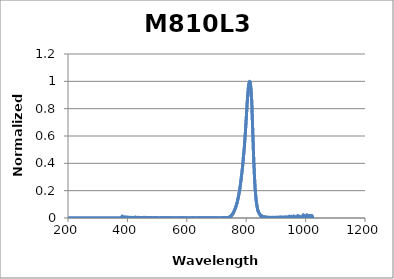
| Category | Normalized Intensity |
|---|---|
| 199.97546 | 0 |
| 200.17692 | 0 |
| 200.37839 | 0 |
| 200.57989 | 0 |
| 200.7814 | 0 |
| 200.98293 | 0 |
| 201.18448 | 0 |
| 201.38605 | 0 |
| 201.58764 | 0 |
| 201.78925 | 0 |
| 201.99087 | 0 |
| 202.19252 | 0 |
| 202.39418 | 0 |
| 202.59586 | 0 |
| 202.79756 | 0 |
| 202.99928 | 0 |
| 203.20102 | 0 |
| 203.40278 | 0 |
| 203.60455 | 0 |
| 203.80635 | 0 |
| 204.00816 | 0 |
| 204.20999 | 0 |
| 204.41184 | 0 |
| 204.61371 | 0 |
| 204.8156 | 0 |
| 205.0175 | 0 |
| 205.21943 | 0 |
| 205.42137 | 0 |
| 205.62334 | 0 |
| 205.82532 | 0 |
| 206.02732 | 0 |
| 206.22934 | 0 |
| 206.43137 | 0 |
| 206.63343 | 0 |
| 206.83551 | 0 |
| 207.0376 | 0 |
| 207.23971 | 0 |
| 207.44184 | 0 |
| 207.64399 | 0 |
| 207.84616 | 0 |
| 208.04835 | 0 |
| 208.25055 | 0 |
| 208.45278 | 0 |
| 208.65502 | 0 |
| 208.85728 | 0 |
| 209.05956 | 0 |
| 209.26186 | 0 |
| 209.46418 | 0 |
| 209.66651 | 0 |
| 209.86887 | 0 |
| 210.07124 | 0 |
| 210.27363 | 0 |
| 210.47604 | 0 |
| 210.67847 | 0 |
| 210.88092 | 0 |
| 211.08338 | 0 |
| 211.28587 | 0 |
| 211.48837 | 0 |
| 211.69089 | 0 |
| 211.89343 | 0 |
| 212.09599 | 0 |
| 212.29857 | 0 |
| 212.50117 | 0 |
| 212.70378 | 0 |
| 212.90641 | 0 |
| 213.10907 | 0 |
| 213.31174 | 0 |
| 213.51442 | 0 |
| 213.71713 | 0 |
| 213.91986 | 0 |
| 214.1226 | 0 |
| 214.32537 | 0 |
| 214.52815 | 0 |
| 214.73095 | 0 |
| 214.93376 | 0 |
| 215.1366 | 0 |
| 215.33946 | 0 |
| 215.54233 | 0 |
| 215.74522 | 0 |
| 215.94813 | 0 |
| 216.15106 | 0 |
| 216.35401 | 0 |
| 216.55698 | 0 |
| 216.75996 | 0 |
| 216.96297 | 0 |
| 217.16599 | 0 |
| 217.36903 | 0 |
| 217.57209 | 0 |
| 217.77517 | 0 |
| 217.97826 | 0 |
| 218.18138 | 0 |
| 218.38451 | 0 |
| 218.58766 | 0 |
| 218.79083 | 0 |
| 218.99402 | 0 |
| 219.19722 | 0 |
| 219.40045 | 0 |
| 219.60369 | 0 |
| 219.80695 | 0 |
| 220.01023 | 0 |
| 220.21353 | 0 |
| 220.41685 | 0 |
| 220.62018 | 0 |
| 220.82354 | 0 |
| 221.02691 | 0 |
| 221.2303 | 0 |
| 221.43371 | 0 |
| 221.63713 | 0 |
| 221.84058 | 0 |
| 222.04404 | 0 |
| 222.24753 | 0 |
| 222.45103 | 0 |
| 222.65455 | 0 |
| 222.85808 | 0 |
| 223.06164 | 0 |
| 223.26521 | 0 |
| 223.46881 | 0 |
| 223.67242 | 0 |
| 223.87605 | 0 |
| 224.07969 | 0 |
| 224.28336 | 0 |
| 224.48704 | 0 |
| 224.69075 | 0 |
| 224.89447 | 0 |
| 225.0982 | 0 |
| 225.30196 | 0 |
| 225.50574 | 0 |
| 225.70953 | 0 |
| 225.91334 | 0 |
| 226.11717 | 0 |
| 226.32102 | 0 |
| 226.52489 | 0 |
| 226.72878 | 0 |
| 226.93268 | 0 |
| 227.1366 | 0 |
| 227.34054 | 0 |
| 227.5445 | 0 |
| 227.74848 | 0 |
| 227.95247 | 0 |
| 228.15649 | 0 |
| 228.36052 | 0 |
| 228.56457 | 0 |
| 228.76863 | 0 |
| 228.97272 | 0 |
| 229.17683 | 0 |
| 229.38095 | 0 |
| 229.58509 | 0 |
| 229.78925 | 0 |
| 229.99343 | 0 |
| 230.19762 | 0 |
| 230.40183 | 0 |
| 230.60607 | 0 |
| 230.81032 | 0 |
| 231.01459 | 0 |
| 231.21887 | 0 |
| 231.42318 | 0 |
| 231.6275 | 0 |
| 231.83184 | 0 |
| 232.0362 | 0 |
| 232.24058 | 0 |
| 232.44497 | 0 |
| 232.64939 | 0 |
| 232.85382 | 0 |
| 233.05827 | 0 |
| 233.26274 | 0 |
| 233.46722 | 0 |
| 233.67173 | 0 |
| 233.87625 | 0 |
| 234.08079 | 0 |
| 234.28535 | 0 |
| 234.48993 | 0 |
| 234.69452 | 0 |
| 234.89914 | 0 |
| 235.10377 | 0 |
| 235.30842 | 0 |
| 235.51309 | 0 |
| 235.71777 | 0 |
| 235.92248 | 0 |
| 236.1272 | 0 |
| 236.33194 | 0 |
| 236.5367 | 0 |
| 236.74147 | 0 |
| 236.94627 | 0 |
| 237.15108 | 0 |
| 237.35591 | 0 |
| 237.56076 | 0 |
| 237.76563 | 0 |
| 237.97051 | 0 |
| 238.17541 | 0 |
| 238.38033 | 0 |
| 238.58527 | 0 |
| 238.79023 | 0 |
| 238.9952 | 0 |
| 239.2002 | 0 |
| 239.40521 | 0 |
| 239.61024 | 0 |
| 239.81529 | 0 |
| 240.02035 | 0 |
| 240.22543 | 0 |
| 240.43053 | 0 |
| 240.63565 | 0 |
| 240.84079 | 0 |
| 241.04595 | 0 |
| 241.25112 | 0 |
| 241.45631 | 0 |
| 241.66152 | 0 |
| 241.86675 | 0 |
| 242.07199 | 0 |
| 242.27726 | 0 |
| 242.48254 | 0 |
| 242.68784 | 0 |
| 242.89315 | 0 |
| 243.09849 | 0 |
| 243.30384 | 0 |
| 243.50921 | 0 |
| 243.7146 | 0 |
| 243.92001 | 0 |
| 244.12543 | 0 |
| 244.33087 | 0 |
| 244.53633 | 0 |
| 244.74181 | 0 |
| 244.94731 | 0 |
| 245.15282 | 0 |
| 245.35836 | 0 |
| 245.56391 | 0 |
| 245.76948 | 0 |
| 245.97506 | 0 |
| 246.18067 | 0 |
| 246.38629 | 0 |
| 246.59193 | 0 |
| 246.79758 | 0 |
| 247.00326 | 0 |
| 247.20895 | 0 |
| 247.41466 | 0 |
| 247.62039 | 0 |
| 247.82614 | 0 |
| 248.03191 | 0 |
| 248.23769 | 0 |
| 248.44349 | 0 |
| 248.64931 | 0 |
| 248.85514 | 0 |
| 249.061 | 0 |
| 249.26687 | 0 |
| 249.47276 | 0 |
| 249.67867 | 0 |
| 249.88459 | 0 |
| 250.09054 | 0 |
| 250.2965 | 0 |
| 250.50248 | 0 |
| 250.70847 | 0 |
| 250.91449 | 0 |
| 251.12052 | 0 |
| 251.32657 | 0 |
| 251.53264 | 0 |
| 251.73872 | 0 |
| 251.94483 | 0 |
| 252.15095 | 0 |
| 252.35709 | 0 |
| 252.56325 | 0 |
| 252.76942 | 0 |
| 252.97561 | 0 |
| 253.18182 | 0 |
| 253.38805 | 0 |
| 253.5943 | 0 |
| 253.80056 | 0 |
| 254.00684 | 0 |
| 254.21314 | 0 |
| 254.41946 | 0 |
| 254.62579 | 0 |
| 254.83214 | 0 |
| 255.03851 | 0 |
| 255.2449 | 0 |
| 255.45131 | 0 |
| 255.65773 | 0 |
| 255.86417 | 0 |
| 256.07063 | 0 |
| 256.27711 | 0 |
| 256.4836 | 0 |
| 256.69011 | 0 |
| 256.89664 | 0 |
| 257.10319 | 0 |
| 257.30975 | 0 |
| 257.51634 | 0 |
| 257.72294 | 0 |
| 257.92955 | 0 |
| 258.13619 | 0 |
| 258.34284 | 0 |
| 258.54951 | 0 |
| 258.7562 | 0 |
| 258.96291 | 0 |
| 259.16963 | 0 |
| 259.37637 | 0 |
| 259.58313 | 0 |
| 259.78991 | 0 |
| 259.9967 | 0 |
| 260.20351 | 0 |
| 260.41034 | 0 |
| 260.61719 | 0 |
| 260.82406 | 0 |
| 261.03094 | 0 |
| 261.23784 | 0 |
| 261.44476 | 0 |
| 261.65169 | 0 |
| 261.85864 | 0 |
| 262.06561 | 0 |
| 262.2726 | 0 |
| 262.47961 | 0 |
| 262.68663 | 0 |
| 262.89367 | 0 |
| 263.10073 | 0 |
| 263.30781 | 0 |
| 263.5149 | 0 |
| 263.72201 | 0 |
| 263.92914 | 0 |
| 264.13629 | 0 |
| 264.34345 | 0 |
| 264.55063 | 0 |
| 264.75783 | 0 |
| 264.96505 | 0 |
| 265.17228 | 0 |
| 265.37953 | 0 |
| 265.5868 | 0 |
| 265.79409 | 0 |
| 266.00139 | 0 |
| 266.20871 | 0 |
| 266.41605 | 0 |
| 266.62341 | 0 |
| 266.83078 | 0 |
| 267.03817 | 0 |
| 267.24558 | 0 |
| 267.45301 | 0 |
| 267.66045 | 0 |
| 267.86791 | 0 |
| 268.07539 | 0 |
| 268.28289 | 0 |
| 268.4904 | 0 |
| 268.69793 | 0 |
| 268.90548 | 0 |
| 269.11305 | 0 |
| 269.32063 | 0 |
| 269.52823 | 0 |
| 269.73585 | 0 |
| 269.94349 | 0 |
| 270.15114 | 0 |
| 270.35881 | 0 |
| 270.5665 | 0 |
| 270.77421 | 0 |
| 270.98193 | 0 |
| 271.18967 | 0 |
| 271.39743 | 0 |
| 271.60521 | 0 |
| 271.813 | 0 |
| 272.02081 | 0 |
| 272.22864 | 0 |
| 272.43648 | 0 |
| 272.64434 | 0 |
| 272.85222 | 0 |
| 273.06012 | 0 |
| 273.26804 | 0 |
| 273.47597 | 0 |
| 273.68392 | 0 |
| 273.89188 | 0 |
| 274.09987 | 0 |
| 274.30787 | 0 |
| 274.51589 | 0 |
| 274.72392 | 0 |
| 274.93198 | 0 |
| 275.14005 | 0 |
| 275.34814 | 0 |
| 275.55624 | 0 |
| 275.76437 | 0 |
| 275.97251 | 0 |
| 276.18066 | 0 |
| 276.38884 | 0 |
| 276.59703 | 0 |
| 276.80524 | 0 |
| 277.01347 | 0 |
| 277.22171 | 0 |
| 277.42997 | 0 |
| 277.63825 | 0 |
| 277.84655 | 0 |
| 278.05486 | 0 |
| 278.26319 | 0 |
| 278.47154 | 0 |
| 278.6799 | 0 |
| 278.88829 | 0 |
| 279.09669 | 0 |
| 279.3051 | 0 |
| 279.51354 | 0 |
| 279.72199 | 0 |
| 279.93046 | 0 |
| 280.13894 | 0 |
| 280.34745 | 0 |
| 280.55597 | 0 |
| 280.7645 | 0 |
| 280.97306 | 0 |
| 281.18163 | 0 |
| 281.39022 | 0 |
| 281.59883 | 0 |
| 281.80745 | 0 |
| 282.01609 | 0 |
| 282.22475 | 0 |
| 282.43342 | 0 |
| 282.64212 | 0 |
| 282.85083 | 0 |
| 283.05955 | 0 |
| 283.2683 | 0 |
| 283.47706 | 0 |
| 283.68584 | 0 |
| 283.89463 | 0 |
| 284.10345 | 0 |
| 284.31228 | 0 |
| 284.52112 | 0 |
| 284.72999 | 0 |
| 284.93887 | 0 |
| 285.14777 | 0 |
| 285.35668 | 0 |
| 285.56562 | 0 |
| 285.77457 | 0 |
| 285.98353 | 0 |
| 286.19252 | 0 |
| 286.40152 | 0 |
| 286.61054 | 0 |
| 286.81957 | 0 |
| 287.02863 | 0 |
| 287.2377 | 0 |
| 287.44678 | 0 |
| 287.65589 | 0 |
| 287.86501 | 0 |
| 288.07415 | 0 |
| 288.2833 | 0 |
| 288.49248 | 0 |
| 288.70167 | 0 |
| 288.91087 | 0 |
| 289.1201 | 0 |
| 289.32934 | 0 |
| 289.53859 | 0 |
| 289.74787 | 0 |
| 289.95716 | 0 |
| 290.16647 | 0 |
| 290.3758 | 0 |
| 290.58514 | 0 |
| 290.7945 | 0 |
| 291.00388 | 0 |
| 291.21327 | 0 |
| 291.42268 | 0 |
| 291.63211 | 0 |
| 291.84156 | 0 |
| 292.05102 | 0 |
| 292.2605 | 0 |
| 292.47 | 0 |
| 292.67951 | 0 |
| 292.88904 | 0 |
| 293.09859 | 0 |
| 293.30815 | 0 |
| 293.51773 | 0 |
| 293.72733 | 0 |
| 293.93695 | 0 |
| 294.14658 | 0 |
| 294.35623 | 0 |
| 294.56589 | 0 |
| 294.77558 | 0 |
| 294.98528 | 0 |
| 295.195 | 0 |
| 295.40473 | 0 |
| 295.61448 | 0 |
| 295.82425 | 0 |
| 296.03403 | 0 |
| 296.24384 | 0 |
| 296.45366 | 0 |
| 296.66349 | 0 |
| 296.87334 | 0 |
| 297.08321 | 0 |
| 297.2931 | 0 |
| 297.503 | 0 |
| 297.71292 | 0 |
| 297.92286 | 0 |
| 298.13282 | 0 |
| 298.34279 | 0 |
| 298.55277 | 0 |
| 298.76278 | 0 |
| 298.9728 | 0 |
| 299.18284 | 0 |
| 299.3929 | 0 |
| 299.60297 | 0 |
| 299.81306 | 0 |
| 300.02316 | 0 |
| 300.23329 | 0 |
| 300.44343 | 0 |
| 300.65358 | 0 |
| 300.86376 | 0 |
| 301.07395 | 0 |
| 301.28416 | 0 |
| 301.49438 | 0 |
| 301.70462 | 0 |
| 301.91488 | 0 |
| 302.12515 | 0 |
| 302.33544 | 0 |
| 302.54575 | 0 |
| 302.75608 | 0 |
| 302.96642 | 0 |
| 303.17678 | 0 |
| 303.38715 | 0 |
| 303.59755 | 0 |
| 303.80796 | 0 |
| 304.01838 | 0 |
| 304.22882 | 0 |
| 304.43928 | 0 |
| 304.64976 | 0 |
| 304.86025 | 0 |
| 305.07076 | 0 |
| 305.28129 | 0 |
| 305.49183 | 0 |
| 305.70239 | 0 |
| 305.91297 | 0 |
| 306.12356 | 0 |
| 306.33417 | 0 |
| 306.5448 | 0 |
| 306.75545 | 0 |
| 306.96611 | 0 |
| 307.17678 | 0 |
| 307.38748 | 0 |
| 307.59819 | 0 |
| 307.80892 | 0 |
| 308.01966 | 0 |
| 308.23042 | 0 |
| 308.4412 | 0 |
| 308.65199 | 0 |
| 308.8628 | 0 |
| 309.07363 | 0 |
| 309.28448 | 0 |
| 309.49534 | 0 |
| 309.70622 | 0 |
| 309.91711 | 0 |
| 310.12802 | 0 |
| 310.33895 | 0 |
| 310.54989 | 0 |
| 310.76085 | 0 |
| 310.97183 | 0 |
| 311.18283 | 0 |
| 311.39384 | 0 |
| 311.60487 | 0 |
| 311.81591 | 0 |
| 312.02697 | 0 |
| 312.23805 | 0 |
| 312.44914 | 0 |
| 312.66025 | 0 |
| 312.87138 | 0 |
| 313.08253 | 0 |
| 313.29369 | 0 |
| 313.50486 | 0 |
| 313.71606 | 0 |
| 313.92727 | 0 |
| 314.1385 | 0 |
| 314.34974 | 0 |
| 314.561 | 0 |
| 314.77228 | 0 |
| 314.98357 | 0 |
| 315.19488 | 0 |
| 315.40621 | 0 |
| 315.61755 | 0 |
| 315.82891 | 0 |
| 316.04029 | 0 |
| 316.25168 | 0 |
| 316.46309 | 0 |
| 316.67452 | 0 |
| 316.88596 | 0 |
| 317.09742 | 0 |
| 317.3089 | 0 |
| 317.52039 | 0 |
| 317.7319 | 0 |
| 317.94342 | 0 |
| 318.15496 | 0 |
| 318.36652 | 0 |
| 318.5781 | 0 |
| 318.78969 | 0 |
| 319.0013 | 0 |
| 319.21292 | 0 |
| 319.42456 | 0 |
| 319.63622 | 0 |
| 319.84789 | 0 |
| 320.05958 | 0 |
| 320.27129 | 0 |
| 320.48302 | 0 |
| 320.69476 | 0 |
| 320.90651 | 0 |
| 321.11828 | 0 |
| 321.33007 | 0 |
| 321.54188 | 0 |
| 321.7537 | 0 |
| 321.96554 | 0 |
| 322.1774 | 0 |
| 322.38927 | 0 |
| 322.60116 | 0 |
| 322.81306 | 0 |
| 323.02498 | 0 |
| 323.23692 | 0 |
| 323.44887 | 0 |
| 323.66084 | 0 |
| 323.87283 | 0 |
| 324.08483 | 0 |
| 324.29685 | 0 |
| 324.50889 | 0 |
| 324.72094 | 0 |
| 324.93301 | 0 |
| 325.14509 | 0 |
| 325.35719 | 0 |
| 325.56931 | 0 |
| 325.78145 | 0 |
| 325.9936 | 0 |
| 326.20576 | 0 |
| 326.41795 | 0 |
| 326.63015 | 0 |
| 326.84236 | 0 |
| 327.0546 | 0 |
| 327.26684 | 0 |
| 327.47911 | 0 |
| 327.69139 | 0 |
| 327.90369 | 0 |
| 328.116 | 0 |
| 328.32833 | 0 |
| 328.54068 | 0 |
| 328.75304 | 0 |
| 328.96542 | 0 |
| 329.17782 | 0 |
| 329.39023 | 0 |
| 329.60266 | 0 |
| 329.8151 | 0 |
| 330.02756 | 0 |
| 330.24004 | 0 |
| 330.45253 | 0 |
| 330.66504 | 0 |
| 330.87757 | 0 |
| 331.09011 | 0 |
| 331.30267 | 0 |
| 331.51525 | 0 |
| 331.72784 | 0 |
| 331.94045 | 0 |
| 332.15307 | 0 |
| 332.36571 | 0 |
| 332.57837 | 0 |
| 332.79104 | 0 |
| 333.00373 | 0 |
| 333.21643 | 0 |
| 333.42915 | 0 |
| 333.64189 | 0 |
| 333.85464 | 0 |
| 334.06741 | 0 |
| 334.2802 | 0 |
| 334.493 | 0 |
| 334.70582 | 0 |
| 334.91866 | 0 |
| 335.13151 | 0 |
| 335.34437 | 0 |
| 335.55726 | 0 |
| 335.77016 | 0 |
| 335.98307 | 0 |
| 336.196 | 0 |
| 336.40895 | 0 |
| 336.62192 | 0 |
| 336.8349 | 0 |
| 337.04789 | 0 |
| 337.26091 | 0 |
| 337.47394 | 0 |
| 337.68698 | 0 |
| 337.90004 | 0 |
| 338.11312 | 0 |
| 338.32621 | 0 |
| 338.53932 | 0 |
| 338.75245 | 0 |
| 338.96559 | 0 |
| 339.17875 | 0 |
| 339.39192 | 0 |
| 339.60511 | 0 |
| 339.81832 | 0 |
| 340.03154 | 0 |
| 340.24478 | 0 |
| 340.45804 | 0 |
| 340.67131 | 0 |
| 340.88459 | 0 |
| 341.0979 | 0 |
| 341.31122 | 0 |
| 341.52455 | 0 |
| 341.7379 | 0 |
| 341.95127 | 0 |
| 342.16465 | 0 |
| 342.37805 | 0 |
| 342.59147 | 0 |
| 342.8049 | 0 |
| 343.01835 | 0 |
| 343.23181 | 0 |
| 343.44529 | 0 |
| 343.65879 | 0 |
| 343.8723 | 0 |
| 344.08583 | 0 |
| 344.29937 | 0 |
| 344.51293 | 0 |
| 344.72651 | 0 |
| 344.9401 | 0 |
| 345.15371 | 0 |
| 345.36733 | 0 |
| 345.58097 | 0 |
| 345.79463 | 0 |
| 346.0083 | 0 |
| 346.22199 | 0 |
| 346.43569 | 0 |
| 346.64941 | 0 |
| 346.86315 | 0 |
| 347.0769 | 0 |
| 347.29067 | 0 |
| 347.50446 | 0 |
| 347.71826 | 0 |
| 347.93207 | 0 |
| 348.1459 | 0 |
| 348.35975 | 0 |
| 348.57362 | 0 |
| 348.78749 | 0 |
| 349.00139 | 0 |
| 349.2153 | 0 |
| 349.42923 | 0 |
| 349.64317 | 0 |
| 349.85713 | 0 |
| 350.07111 | 0 |
| 350.2851 | 0 |
| 350.49911 | 0 |
| 350.71313 | 0 |
| 350.92717 | 0 |
| 351.14122 | 0 |
| 351.3553 | 0 |
| 351.56938 | 0 |
| 351.78349 | 0 |
| 351.9976 | 0 |
| 352.21174 | 0 |
| 352.42589 | 0 |
| 352.64005 | 0 |
| 352.85424 | 0 |
| 353.06844 | 0 |
| 353.28265 | 0 |
| 353.49688 | 0 |
| 353.71112 | 0 |
| 353.92539 | 0 |
| 354.13966 | 0 |
| 354.35396 | 0 |
| 354.56827 | 0 |
| 354.78259 | 0 |
| 354.99693 | 0 |
| 355.21129 | 0 |
| 355.42566 | 0 |
| 355.64005 | 0 |
| 355.85445 | 0 |
| 356.06887 | 0 |
| 356.28331 | 0 |
| 356.49776 | 0 |
| 356.71223 | 0 |
| 356.92671 | 0 |
| 357.14121 | 0 |
| 357.35572 | 0 |
| 357.57025 | 0 |
| 357.7848 | 0 |
| 357.99936 | 0 |
| 358.21394 | 0 |
| 358.42853 | 0 |
| 358.64314 | 0 |
| 358.85777 | 0 |
| 359.07241 | 0 |
| 359.28706 | 0 |
| 359.50173 | 0 |
| 359.71642 | 0 |
| 359.93113 | 0 |
| 360.14585 | 0 |
| 360.36058 | 0 |
| 360.57533 | 0 |
| 360.7901 | 0 |
| 361.00488 | 0 |
| 361.21968 | 0 |
| 361.43449 | 0 |
| 361.64932 | 0 |
| 361.86417 | 0 |
| 362.07903 | 0 |
| 362.29391 | 0 |
| 362.5088 | 0 |
| 362.72371 | 0 |
| 362.93863 | 0 |
| 363.15357 | 0 |
| 363.36852 | 0 |
| 363.58349 | 0 |
| 363.79848 | 0 |
| 364.01348 | 0 |
| 364.2285 | 0 |
| 364.44353 | 0 |
| 364.65858 | 0 |
| 364.87365 | 0 |
| 365.08873 | 0 |
| 365.30382 | 0 |
| 365.51894 | 0 |
| 365.73406 | 0 |
| 365.94921 | 0 |
| 366.16436 | 0 |
| 366.37954 | 0 |
| 366.59473 | 0 |
| 366.80993 | 0 |
| 367.02515 | 0 |
| 367.24039 | 0 |
| 367.45564 | 0 |
| 367.67091 | 0 |
| 367.88619 | 0 |
| 368.10149 | 0 |
| 368.31681 | 0 |
| 368.53214 | 0 |
| 368.74748 | 0 |
| 368.96285 | 0 |
| 369.17822 | 0 |
| 369.39361 | 0 |
| 369.60902 | 0 |
| 369.82445 | 0 |
| 370.03989 | 0 |
| 370.25534 | 0 |
| 370.47081 | 0 |
| 370.6863 | 0 |
| 370.9018 | 0 |
| 371.11731 | 0 |
| 371.33285 | 0 |
| 371.54839 | 0 |
| 371.76396 | 0 |
| 371.97954 | 0 |
| 372.19513 | 0 |
| 372.41074 | 0 |
| 372.62637 | 0 |
| 372.84201 | 0 |
| 373.05766 | 0 |
| 373.27334 | 0 |
| 373.48902 | 0 |
| 373.70473 | 0 |
| 373.92044 | 0 |
| 374.13618 | 0 |
| 374.35193 | 0 |
| 374.56769 | 0 |
| 374.78347 | 0 |
| 374.99927 | 0 |
| 375.21508 | 0 |
| 375.43091 | 0 |
| 375.64675 | 0 |
| 375.86261 | 0 |
| 376.07848 | 0 |
| 376.29437 | 0 |
| 376.51027 | 0 |
| 376.72619 | 0 |
| 376.94213 | 0 |
| 377.15808 | 0 |
| 377.37404 | 0 |
| 377.59002 | 0 |
| 377.80602 | 0 |
| 378.02203 | 0 |
| 378.23806 | 0 |
| 378.4541 | 0 |
| 378.67016 | 0 |
| 378.88623 | 0 |
| 379.10232 | 0 |
| 379.31842 | 0 |
| 379.53454 | 0 |
| 379.75068 | 0 |
| 379.96683 | 0 |
| 380.183 | 0 |
| 380.39918 | 0 |
| 380.61537 | 0 |
| 380.83158 | 0 |
| 381.04781 | -0.001 |
| 381.26405 | 0 |
| 381.48031 | 0.009 |
| 381.69659 | -0.006 |
| 381.91287 | 0.003 |
| 382.12918 | -0.023 |
| 382.3455 | 0.014 |
| 382.56183 | -0.001 |
| 382.77818 | -0.005 |
| 382.99455 | -0.003 |
| 383.21093 | 0.003 |
| 383.42732 | -0.001 |
| 383.64373 | 0.008 |
| 383.86016 | -0.002 |
| 384.0766 | 0.002 |
| 384.29306 | 0 |
| 384.50953 | -0.001 |
| 384.72602 | -0.014 |
| 384.94252 | 0.012 |
| 385.15904 | -0.007 |
| 385.37557 | -0.004 |
| 385.59212 | -0.005 |
| 385.80868 | 0.002 |
| 386.02526 | -0.006 |
| 386.24186 | 0.002 |
| 386.45847 | -0.003 |
| 386.67509 | -0.001 |
| 386.89173 | -0.005 |
| 387.10839 | 0.004 |
| 387.32506 | -0.008 |
| 387.54174 | -0.001 |
| 387.75844 | 0.002 |
| 387.97516 | 0.008 |
| 388.19189 | 0 |
| 388.40864 | 0.003 |
| 388.6254 | -0.003 |
| 388.84218 | -0.002 |
| 389.05897 | -0.002 |
| 389.27578 | 0 |
| 389.4926 | 0 |
| 389.70944 | -0.004 |
| 389.92629 | 0.001 |
| 390.14316 | 0.001 |
| 390.36004 | -0.005 |
| 390.57694 | 0.003 |
| 390.79385 | -0.007 |
| 391.01078 | 0.009 |
| 391.22773 | -0.004 |
| 391.44469 | 0 |
| 391.66166 | 0 |
| 391.87865 | 0 |
| 392.09566 | -0.004 |
| 392.31268 | 0.003 |
| 392.52971 | -0.006 |
| 392.74676 | 0.002 |
| 392.96383 | -0.004 |
| 393.18091 | 0.004 |
| 393.398 | -0.005 |
| 393.61511 | 0.002 |
| 393.83224 | 0.003 |
| 394.04938 | 0.006 |
| 394.26653 | 0.003 |
| 394.48371 | 0.001 |
| 394.70089 | -0.005 |
| 394.91809 | 0.001 |
| 395.13531 | -0.008 |
| 395.35254 | 0.001 |
| 395.56979 | -0.002 |
| 395.78705 | 0.006 |
| 396.00433 | -0.003 |
| 396.22162 | 0.001 |
| 396.43892 | -0.002 |
| 396.65625 | 0.006 |
| 396.87358 | -0.004 |
| 397.09094 | 0.002 |
| 397.3083 | -0.003 |
| 397.52568 | 0.008 |
| 397.74308 | 0 |
| 397.96049 | 0.004 |
| 398.17792 | 0.001 |
| 398.39536 | -0.003 |
| 398.61282 | -0.007 |
| 398.83029 | -0.002 |
| 399.04778 | -0.002 |
| 399.26528 | 0.001 |
| 399.4828 | -0.004 |
| 399.70033 | 0.004 |
| 399.91788 | 0.002 |
| 400.13544 | 0.002 |
| 400.35302 | 0.002 |
| 400.57061 | 0 |
| 400.78822 | -0.004 |
| 401.00584 | 0.003 |
| 401.22348 | 0.005 |
| 401.44113 | 0.006 |
| 401.6588 | -0.003 |
| 401.87648 | 0.003 |
| 402.09418 | -0.004 |
| 402.31189 | 0.004 |
| 402.52962 | -0.003 |
| 402.74736 | 0.002 |
| 402.96512 | 0.003 |
| 403.18289 | -0.002 |
| 403.40067 | -0.003 |
| 403.61848 | 0.005 |
| 403.83629 | -0.003 |
| 404.05412 | 0.001 |
| 404.27197 | 0.003 |
| 404.48983 | 0 |
| 404.70771 | -0.003 |
| 404.9256 | 0.005 |
| 405.14351 | 0 |
| 405.36143 | 0.003 |
| 405.57936 | -0.003 |
| 405.79731 | -0.001 |
| 406.01528 | -0.006 |
| 406.23326 | 0.004 |
| 406.45126 | 0 |
| 406.66927 | 0.003 |
| 406.88729 | -0.003 |
| 407.10533 | 0.001 |
| 407.32339 | 0 |
| 407.54146 | 0.002 |
| 407.75954 | 0.003 |
| 407.97764 | 0 |
| 408.19576 | -0.002 |
| 408.41389 | -0.003 |
| 408.63203 | -0.001 |
| 408.85019 | -0.002 |
| 409.06836 | 0.004 |
| 409.28655 | -0.003 |
| 409.50476 | 0.003 |
| 409.72297 | 0.002 |
| 409.94121 | 0.003 |
| 410.15946 | -0.005 |
| 410.37772 | 0.002 |
| 410.596 | 0.001 |
| 410.81429 | 0.003 |
| 411.0326 | -0.005 |
| 411.25092 | 0.003 |
| 411.46925 | -0.001 |
| 411.68761 | 0.006 |
| 411.90597 | -0.002 |
| 412.12435 | 0.002 |
| 412.34275 | 0 |
| 412.56116 | -0.008 |
| 412.77959 | -0.002 |
| 412.99803 | 0 |
| 413.21648 | -0.004 |
| 413.43495 | 0.003 |
| 413.65344 | -0.001 |
| 413.87193 | 0 |
| 414.09045 | -0.001 |
| 414.30898 | 0.004 |
| 414.52752 | -0.002 |
| 414.74608 | 0.002 |
| 414.96465 | -0.003 |
| 415.18324 | 0.002 |
| 415.40184 | -0.003 |
| 415.62046 | 0 |
| 415.83909 | -0.001 |
| 416.05774 | 0.001 |
| 416.2764 | -0.001 |
| 416.49508 | -0.002 |
| 416.71377 | -0.004 |
| 416.93247 | 0.004 |
| 417.15119 | 0 |
| 417.36993 | 0.002 |
| 417.58868 | 0 |
| 417.80744 | 0.002 |
| 418.02622 | 0.001 |
| 418.24501 | 0 |
| 418.46382 | -0.007 |
| 418.68264 | 0.003 |
| 418.90148 | -0.003 |
| 419.12033 | 0.001 |
| 419.3392 | -0.002 |
| 419.55808 | 0.001 |
| 419.77698 | -0.004 |
| 419.99589 | 0.003 |
| 420.21481 | -0.002 |
| 420.43375 | 0 |
| 420.65271 | -0.001 |
| 420.87167 | -0.001 |
| 421.09066 | -0.002 |
| 421.30966 | -0.002 |
| 421.52867 | -0.003 |
| 421.7477 | 0.003 |
| 421.96674 | -0.002 |
| 422.1858 | 0.005 |
| 422.40487 | -0.003 |
| 422.62395 | 0 |
| 422.84305 | 0 |
| 423.06217 | 0 |
| 423.2813 | -0.004 |
| 423.50044 | 0.006 |
| 423.7196 | -0.001 |
| 423.93878 | 0.006 |
| 424.15796 | -0.002 |
| 424.37717 | 0.001 |
| 424.59638 | -0.002 |
| 424.81561 | 0.004 |
| 425.03486 | -0.003 |
| 425.25412 | 0.002 |
| 425.4734 | -0.002 |
| 425.69269 | 0.001 |
| 425.91199 | -0.002 |
| 426.13131 | 0.002 |
| 426.35064 | -0.001 |
| 426.56999 | -0.001 |
| 426.78935 | -0.001 |
| 427.00873 | -0.003 |
| 427.22812 | 0.002 |
| 427.44753 | 0.007 |
| 427.66695 | 0.001 |
| 427.88638 | 0.002 |
| 428.10583 | -0.004 |
| 428.3253 | 0.002 |
| 428.54477 | 0 |
| 428.76427 | 0.003 |
| 428.98377 | 0.002 |
| 429.2033 | 0.001 |
| 429.42283 | -0.002 |
| 429.64238 | 0 |
| 429.86195 | -0.005 |
| 430.08153 | 0 |
| 430.30112 | -0.004 |
| 430.52073 | 0 |
| 430.74035 | 0 |
| 430.95999 | 0.001 |
| 431.17964 | 0 |
| 431.39931 | 0.002 |
| 431.61899 | 0 |
| 431.83868 | 0.003 |
| 432.05839 | 0.001 |
| 432.27812 | -0.002 |
| 432.49785 | -0.004 |
| 432.71761 | 0 |
| 432.93737 | -0.001 |
| 433.15716 | 0.001 |
| 433.37695 | 0.002 |
| 433.59676 | 0.004 |
| 433.81659 | -0.003 |
| 434.03643 | 0 |
| 434.25628 | -0.004 |
| 434.47615 | 0.001 |
| 434.69603 | -0.001 |
| 434.91593 | 0.002 |
| 435.13584 | -0.003 |
| 435.35576 | 0.002 |
| 435.5757 | -0.001 |
| 435.79565 | 0.005 |
| 436.01562 | 0 |
| 436.23561 | 0.001 |
| 436.4556 | -0.004 |
| 436.67561 | 0.001 |
| 436.89564 | -0.001 |
| 437.11568 | 0.001 |
| 437.33573 | -0.002 |
| 437.5558 | 0.002 |
| 437.77589 | -0.001 |
| 437.99598 | 0.005 |
| 438.21609 | -0.001 |
| 438.43622 | 0.003 |
| 438.65636 | 0.001 |
| 438.87651 | 0.003 |
| 439.09668 | -0.001 |
| 439.31687 | 0.003 |
| 439.53706 | -0.001 |
| 439.75727 | 0.001 |
| 439.9775 | -0.002 |
| 440.19774 | 0 |
| 440.41799 | 0.002 |
| 440.63826 | 0 |
| 440.85855 | -0.001 |
| 441.07884 | 0.003 |
| 441.29915 | -0.001 |
| 441.51948 | 0.001 |
| 441.73982 | 0 |
| 441.96017 | 0.003 |
| 442.18054 | 0 |
| 442.40092 | -0.001 |
| 442.62132 | 0.001 |
| 442.84173 | 0 |
| 443.06216 | -0.003 |
| 443.2826 | 0.002 |
| 443.50305 | -0.002 |
| 443.72352 | -0.001 |
| 443.944 | -0.002 |
| 444.1645 | 0 |
| 444.38501 | 0 |
| 444.60553 | 0.002 |
| 444.82607 | 0 |
| 445.04662 | 0.002 |
| 445.26719 | -0.002 |
| 445.48777 | 0.001 |
| 445.70837 | 0 |
| 445.92898 | 0.003 |
| 446.1496 | -0.003 |
| 446.37024 | 0.002 |
| 446.59089 | -0.001 |
| 446.81156 | 0.004 |
| 447.03224 | 0 |
| 447.25293 | 0.001 |
| 447.47364 | -0.004 |
| 447.69436 | 0.001 |
| 447.9151 | 0 |
| 448.13585 | 0 |
| 448.35662 | -0.003 |
| 448.5774 | 0.003 |
| 448.79819 | -0.001 |
| 449.019 | 0.001 |
| 449.23982 | -0.004 |
| 449.46065 | 0.001 |
| 449.6815 | -0.002 |
| 449.90237 | 0.003 |
| 450.12325 | -0.004 |
| 450.34414 | 0.001 |
| 450.56504 | -0.001 |
| 450.78597 | 0.002 |
| 451.0069 | -0.003 |
| 451.22785 | -0.001 |
| 451.44881 | -0.002 |
| 451.66979 | 0.001 |
| 451.89078 | -0.002 |
| 452.11178 | 0.001 |
| 452.3328 | -0.003 |
| 452.55383 | 0.002 |
| 452.77488 | 0 |
| 452.99594 | -0.001 |
| 453.21702 | -0.001 |
| 453.43811 | -0.003 |
| 453.65921 | -0.001 |
| 453.88032 | 0 |
| 454.10146 | -0.002 |
| 454.3226 | 0.003 |
| 454.54376 | 0 |
| 454.76493 | 0.004 |
| 454.98612 | -0.003 |
| 455.20732 | 0.004 |
| 455.42854 | 0.004 |
| 455.64976 | 0.001 |
| 455.87101 | -0.002 |
| 456.09226 | 0.004 |
| 456.31354 | -0.001 |
| 456.53482 | 0.002 |
| 456.75612 | 0.003 |
| 456.97743 | 0.003 |
| 457.19876 | -0.003 |
| 457.4201 | -0.002 |
| 457.64145 | -0.001 |
| 457.86282 | -0.001 |
| 458.08421 | -0.001 |
| 458.3056 | 0.002 |
| 458.52701 | 0 |
| 458.74844 | 0.001 |
| 458.96988 | -0.003 |
| 459.19133 | 0.005 |
| 459.41279 | 0 |
| 459.63427 | 0.001 |
| 459.85577 | -0.003 |
| 460.07728 | 0.003 |
| 460.2988 | -0.001 |
| 460.52033 | 0.001 |
| 460.74188 | 0 |
| 460.96345 | 0.002 |
| 461.18502 | -0.001 |
| 461.40662 | 0.002 |
| 461.62822 | 0.001 |
| 461.84984 | 0 |
| 462.07147 | -0.001 |
| 462.29312 | 0.001 |
| 462.51478 | 0 |
| 462.73645 | 0.002 |
| 462.95814 | -0.003 |
| 463.17984 | 0.001 |
| 463.40156 | -0.001 |
| 463.62329 | 0.002 |
| 463.84503 | 0.001 |
| 464.06679 | -0.002 |
| 464.28856 | -0.001 |
| 464.51035 | 0.002 |
| 464.73215 | -0.001 |
| 464.95396 | -0.001 |
| 465.17579 | 0 |
| 465.39763 | -0.001 |
| 465.61948 | 0 |
| 465.84135 | -0.002 |
| 466.06323 | 0.001 |
| 466.28513 | 0 |
| 466.50704 | 0.001 |
| 466.72896 | -0.002 |
| 466.9509 | 0.002 |
| 467.17285 | -0.001 |
| 467.39481 | -0.002 |
| 467.61679 | -0.004 |
| 467.83878 | 0.001 |
| 468.06079 | -0.003 |
| 468.28281 | 0 |
| 468.50484 | -0.001 |
| 468.72689 | -0.001 |
| 468.94895 | -0.001 |
| 469.17103 | 0.001 |
| 469.39312 | -0.002 |
| 469.61522 | 0 |
| 469.83733 | -0.002 |
| 470.05946 | 0 |
| 470.28161 | 0 |
| 470.50376 | 0.001 |
| 470.72594 | -0.002 |
| 470.94812 | 0.001 |
| 471.17032 | 0 |
| 471.39253 | 0.003 |
| 471.61476 | 0 |
| 471.837 | 0 |
| 472.05925 | -0.002 |
| 472.28152 | 0.002 |
| 472.5038 | -0.001 |
| 472.72609 | -0.001 |
| 472.9484 | -0.001 |
| 473.17072 | 0.001 |
| 473.39305 | -0.003 |
| 473.6154 | 0.001 |
| 473.83777 | -0.002 |
| 474.06014 | 0.001 |
| 474.28253 | 0 |
| 474.50494 | 0.001 |
| 474.72735 | 0 |
| 474.94978 | -0.001 |
| 475.17223 | -0.001 |
| 475.39469 | 0.002 |
| 475.61716 | -0.001 |
| 475.83964 | 0.001 |
| 476.06214 | -0.002 |
| 476.28465 | 0.002 |
| 476.50718 | 0 |
| 476.72972 | 0.002 |
| 476.95227 | -0.001 |
| 477.17484 | 0.003 |
| 477.39742 | -0.001 |
| 477.62001 | 0.001 |
| 477.84262 | 0 |
| 478.06524 | 0 |
| 478.28788 | -0.003 |
| 478.51053 | 0 |
| 478.73319 | -0.001 |
| 478.95586 | -0.002 |
| 479.17855 | -0.003 |
| 479.40126 | 0 |
| 479.62397 | 0.001 |
| 479.8467 | 0.002 |
| 480.06945 | -0.002 |
| 480.2922 | 0.002 |
| 480.51497 | -0.002 |
| 480.73776 | 0 |
| 480.96056 | -0.002 |
| 481.18337 | 0 |
| 481.40619 | -0.002 |
| 481.62903 | 0.001 |
| 481.85188 | 0 |
| 482.07475 | 0.001 |
| 482.29763 | -0.001 |
| 482.52052 | 0.002 |
| 482.74342 | -0.001 |
| 482.96634 | -0.002 |
| 483.18928 | -0.001 |
| 483.41222 | 0.001 |
| 483.63518 | -0.001 |
| 483.85815 | 0 |
| 484.08114 | 0 |
| 484.30414 | -0.001 |
| 484.52715 | -0.001 |
| 484.75018 | 0.001 |
| 484.97322 | 0 |
| 485.19628 | 0.002 |
| 485.41934 | -0.001 |
| 485.64242 | 0.001 |
| 485.86552 | -0.001 |
| 486.08863 | 0.001 |
| 486.31175 | 0 |
| 486.53488 | 0 |
| 486.75803 | -0.002 |
| 486.98119 | -0.002 |
| 487.20437 | 0 |
| 487.42756 | 0.001 |
| 487.65076 | -0.001 |
| 487.87397 | 0 |
| 488.0972 | -0.004 |
| 488.32044 | 0.002 |
| 488.5437 | 0.001 |
| 488.76697 | 0 |
| 488.99025 | -0.003 |
| 489.21354 | 0.001 |
| 489.43685 | 0 |
| 489.66018 | 0.001 |
| 489.88351 | 0 |
| 490.10686 | -0.001 |
| 490.33022 | -0.001 |
| 490.5536 | 0.001 |
| 490.77699 | -0.002 |
| 491.00039 | 0 |
| 491.22381 | -0.001 |
| 491.44724 | 0 |
| 491.67068 | 0.001 |
| 491.89413 | 0.001 |
| 492.1176 | 0 |
| 492.34109 | 0 |
| 492.56458 | -0.002 |
| 492.78809 | -0.001 |
| 493.01161 | -0.001 |
| 493.23515 | 0.001 |
| 493.4587 | -0.002 |
| 493.68226 | 0.003 |
| 493.90584 | -0.001 |
| 494.12943 | 0.001 |
| 494.35303 | 0 |
| 494.57664 | 0.001 |
| 494.80027 | -0.001 |
| 495.02391 | 0 |
| 495.24757 | -0.002 |
| 495.47124 | -0.001 |
| 495.69492 | -0.001 |
| 495.91862 | 0 |
| 496.14232 | -0.003 |
| 496.36605 | 0.001 |
| 496.58978 | 0.001 |
| 496.81353 | 0 |
| 497.03729 | 0.001 |
| 497.26107 | 0.001 |
| 497.48485 | -0.001 |
| 497.70866 | 0 |
| 497.93247 | 0 |
| 498.1563 | -0.001 |
| 498.38014 | -0.001 |
| 498.60399 | 0 |
| 498.82786 | -0.002 |
| 499.05174 | -0.001 |
| 499.27564 | 0 |
| 499.49954 | -0.001 |
| 499.72346 | 0 |
| 499.9474 | 0 |
| 500.17134 | 0 |
| 500.3953 | 0.001 |
| 500.61928 | 0 |
| 500.84326 | -0.002 |
| 501.06726 | 0 |
| 501.29127 | 0.001 |
| 501.5153 | -0.002 |
| 501.73934 | 0.001 |
| 501.96339 | -0.001 |
| 502.18745 | 0 |
| 502.41153 | 0.001 |
| 502.63562 | 0.001 |
| 502.85973 | -0.002 |
| 503.08385 | 0.001 |
| 503.30798 | -0.002 |
| 503.53212 | -0.001 |
| 503.75628 | 0.002 |
| 503.98045 | -0.001 |
| 504.20463 | 0 |
| 504.42883 | 0 |
| 504.65304 | -0.001 |
| 504.87726 | -0.001 |
| 505.1015 | 0 |
| 505.32575 | 0.001 |
| 505.55001 | 0 |
| 505.77428 | 0.001 |
| 505.99857 | -0.001 |
| 506.22287 | 0 |
| 506.44719 | -0.001 |
| 506.67151 | 0 |
| 506.89585 | 0 |
| 507.12021 | 0 |
| 507.34457 | -0.001 |
| 507.56895 | -0.001 |
| 507.79335 | -0.001 |
| 508.01775 | 0.001 |
| 508.24217 | -0.002 |
| 508.4666 | 0.001 |
| 508.69105 | 0 |
| 508.91551 | 0 |
| 509.13998 | -0.001 |
| 509.36446 | 0 |
| 509.58896 | -0.001 |
| 509.81347 | 0.001 |
| 510.03799 | -0.001 |
| 510.26253 | -0.001 |
| 510.48708 | -0.001 |
| 510.71164 | 0 |
| 510.93621 | 0 |
| 511.1608 | 0.001 |
| 511.3854 | 0 |
| 511.61002 | 0.002 |
| 511.83464 | -0.002 |
| 512.05928 | 0 |
| 512.28394 | 0 |
| 512.5086 | 0.001 |
| 512.73328 | -0.001 |
| 512.95797 | 0.001 |
| 513.18268 | -0.001 |
| 513.4074 | 0.001 |
| 513.63213 | 0 |
| 513.85687 | 0.001 |
| 514.08163 | 0.001 |
| 514.3064 | 0.001 |
| 514.53118 | -0.002 |
| 514.75597 | 0.001 |
| 514.98078 | -0.001 |
| 515.2056 | 0.002 |
| 515.43044 | 0 |
| 515.65529 | 0.001 |
| 515.88015 | -0.001 |
| 516.10502 | 0.001 |
| 516.3299 | 0 |
| 516.5548 | 0 |
| 516.77972 | -0.002 |
| 517.00464 | 0.002 |
| 517.22958 | 0 |
| 517.45453 | -0.001 |
| 517.67949 | -0.001 |
| 517.90447 | 0.001 |
| 518.12946 | -0.001 |
| 518.35446 | 0.001 |
| 518.57947 | -0.001 |
| 518.8045 | -0.001 |
| 519.02954 | -0.001 |
| 519.25459 | 0.001 |
| 519.47966 | -0.001 |
| 519.70474 | 0 |
| 519.92983 | -0.001 |
| 520.15493 | 0.001 |
| 520.38005 | 0.001 |
| 520.60518 | 0.001 |
| 520.83033 | 0 |
| 521.05548 | 0.002 |
| 521.28065 | -0.001 |
| 521.50583 | 0.001 |
| 521.73103 | -0.002 |
| 521.95623 | -0.001 |
| 522.18145 | 0 |
| 522.40669 | -0.001 |
| 522.63193 | 0.001 |
| 522.85719 | -0.001 |
| 523.08246 | -0.002 |
| 523.30774 | -0.001 |
| 523.53304 | -0.001 |
| 523.75835 | -0.001 |
| 523.98367 | 0.001 |
| 524.20901 | -0.003 |
| 524.43436 | 0 |
| 524.65972 | 0.001 |
| 524.88509 | 0 |
| 525.11048 | -0.002 |
| 525.33587 | 0.001 |
| 525.56129 | -0.001 |
| 525.78671 | 0 |
| 526.01215 | 0 |
| 526.2376 | 0 |
| 526.46306 | -0.001 |
| 526.68853 | 0.001 |
| 526.91402 | 0.002 |
| 527.13952 | -0.001 |
| 527.36504 | -0.001 |
| 527.59056 | 0 |
| 527.8161 | -0.002 |
| 528.04165 | -0.001 |
| 528.26722 | -0.002 |
| 528.49279 | -0.001 |
| 528.71838 | -0.003 |
| 528.94398 | 0.002 |
| 529.1696 | -0.001 |
| 529.39523 | 0.002 |
| 529.62087 | -0.002 |
| 529.84652 | 0.001 |
| 530.07218 | 0 |
| 530.29786 | 0.001 |
| 530.52355 | -0.001 |
| 530.74926 | 0.001 |
| 530.97497 | 0 |
| 531.2007 | 0.001 |
| 531.42644 | -0.002 |
| 531.6522 | 0 |
| 531.87796 | -0.003 |
| 532.10374 | 0.003 |
| 532.32953 | -0.001 |
| 532.55534 | 0.002 |
| 532.78116 | 0 |
| 533.00698 | 0.001 |
| 533.23283 | -0.002 |
| 533.45868 | 0.002 |
| 533.68455 | -0.001 |
| 533.91043 | 0 |
| 534.13632 | -0.002 |
| 534.36223 | 0 |
| 534.58815 | -0.001 |
| 534.81408 | -0.002 |
| 535.04002 | 0 |
| 535.26597 | 0 |
| 535.49194 | 0 |
| 535.71792 | 0.002 |
| 535.94392 | 0 |
| 536.16992 | 0.002 |
| 536.39594 | -0.001 |
| 536.62197 | 0.001 |
| 536.84801 | 0 |
| 537.07407 | 0.001 |
| 537.30014 | 0 |
| 537.52622 | 0 |
| 537.75231 | 0 |
| 537.97842 | 0.002 |
| 538.20454 | -0.001 |
| 538.43067 | 0 |
| 538.65681 | 0 |
| 538.88297 | 0.001 |
| 539.10914 | -0.002 |
| 539.33532 | -0.001 |
| 539.56151 | 0 |
| 539.78772 | 0 |
| 540.01394 | -0.001 |
| 540.24017 | 0.001 |
| 540.46641 | 0 |
| 540.69267 | 0.001 |
| 540.91893 | -0.001 |
| 541.14522 | -0.002 |
| 541.37151 | 0 |
| 541.59781 | 0 |
| 541.82413 | 0.001 |
| 542.05046 | 0.001 |
| 542.27681 | 0 |
| 542.50316 | -0.001 |
| 542.72953 | -0.001 |
| 542.95591 | 0.001 |
| 543.1823 | 0 |
| 543.40871 | 0.001 |
| 543.63513 | -0.001 |
| 543.86156 | 0.002 |
| 544.088 | 0 |
| 544.31445 | 0.002 |
| 544.54092 | -0.001 |
| 544.7674 | 0.001 |
| 544.99389 | -0.001 |
| 545.2204 | 0 |
| 545.44691 | 0.001 |
| 545.67344 | 0.001 |
| 545.89999 | -0.001 |
| 546.12654 | -0.001 |
| 546.35311 | 0 |
| 546.57968 | 0 |
| 546.80628 | -0.001 |
| 547.03288 | 0 |
| 547.2595 | -0.001 |
| 547.48612 | -0.001 |
| 547.71276 | -0.001 |
| 547.93942 | 0 |
| 548.16608 | 0 |
| 548.39276 | 0 |
| 548.61945 | 0.001 |
| 548.84615 | 0.002 |
| 549.07287 | 0 |
| 549.29959 | 0 |
| 549.52633 | 0 |
| 549.75308 | 0 |
| 549.97985 | 0.001 |
| 550.20662 | 0 |
| 550.43341 | -0.001 |
| 550.66021 | 0 |
| 550.88703 | 0 |
| 551.11385 | 0.001 |
| 551.34069 | -0.001 |
| 551.56754 | -0.001 |
| 551.7944 | -0.002 |
| 552.02128 | -0.001 |
| 552.24816 | 0 |
| 552.47506 | 0.001 |
| 552.70197 | -0.001 |
| 552.9289 | 0 |
| 553.15583 | -0.001 |
| 553.38278 | 0.002 |
| 553.60974 | -0.001 |
| 553.83671 | -0.001 |
| 554.0637 | -0.001 |
| 554.29069 | 0.001 |
| 554.5177 | 0 |
| 554.74473 | 0.001 |
| 554.97176 | -0.001 |
| 555.1988 | 0 |
| 555.42586 | 0 |
| 555.65293 | 0.001 |
| 555.88002 | -0.001 |
| 556.10711 | 0 |
| 556.33422 | -0.001 |
| 556.56134 | 0.001 |
| 556.78847 | -0.001 |
| 557.01561 | 0 |
| 557.24277 | -0.001 |
| 557.46993 | 0.001 |
| 557.69711 | 0 |
| 557.92431 | 0.001 |
| 558.15151 | 0 |
| 558.37873 | 0 |
| 558.60596 | 0 |
| 558.8332 | 0.001 |
| 559.06045 | -0.001 |
| 559.28771 | 0 |
| 559.51499 | -0.001 |
| 559.74228 | 0 |
| 559.96958 | 0 |
| 560.1969 | -0.001 |
| 560.42422 | -0.001 |
| 560.65156 | 0 |
| 560.87891 | -0.001 |
| 561.10627 | 0 |
| 561.33365 | 0 |
| 561.56103 | -0.001 |
| 561.78843 | -0.001 |
| 562.01584 | 0.001 |
| 562.24326 | 0 |
| 562.4707 | 0 |
| 562.69815 | -0.002 |
| 562.9256 | 0.001 |
| 563.15308 | 0 |
| 563.38056 | 0 |
| 563.60805 | -0.001 |
| 563.83556 | 0 |
| 564.06308 | 0 |
| 564.29061 | -0.001 |
| 564.51815 | 0 |
| 564.74571 | 0.001 |
| 564.97328 | -0.001 |
| 565.20086 | 0 |
| 565.42845 | -0.001 |
| 565.65605 | 0.002 |
| 565.88367 | -0.002 |
| 566.11129 | 0.001 |
| 566.33893 | 0 |
| 566.56659 | 0 |
| 566.79425 | -0.001 |
| 567.02192 | 0 |
| 567.24961 | -0.001 |
| 567.47731 | 0.001 |
| 567.70502 | 0 |
| 567.93275 | 0 |
| 568.16048 | -0.001 |
| 568.38823 | 0.001 |
| 568.61599 | 0 |
| 568.84376 | 0 |
| 569.07155 | -0.001 |
| 569.29934 | 0.001 |
| 569.52715 | 0 |
| 569.75497 | 0.001 |
| 569.9828 | -0.001 |
| 570.21064 | 0 |
| 570.4385 | -0.002 |
| 570.66636 | 0.001 |
| 570.89424 | -0.001 |
| 571.12213 | 0 |
| 571.35004 | 0 |
| 571.57795 | -0.001 |
| 571.80588 | 0 |
| 572.03382 | 0 |
| 572.26177 | -0.001 |
| 572.48973 | 0.001 |
| 572.71771 | -0.001 |
| 572.94569 | 0 |
| 573.17369 | 0 |
| 573.4017 | 0.001 |
| 573.62972 | -0.001 |
| 573.85776 | 0 |
| 574.0858 | -0.001 |
| 574.31386 | 0.001 |
| 574.54193 | -0.001 |
| 574.77001 | 0.001 |
| 574.99811 | 0 |
| 575.22621 | 0.001 |
| 575.45433 | -0.001 |
| 575.68246 | 0 |
| 575.9106 | -0.001 |
| 576.13875 | 0.001 |
| 576.36692 | -0.002 |
| 576.59509 | 0.001 |
| 576.82328 | 0 |
| 577.05148 | 0.001 |
| 577.27969 | 0 |
| 577.50792 | 0.001 |
| 577.73615 | -0.001 |
| 577.9644 | 0.002 |
| 578.19266 | -0.001 |
| 578.42093 | 0.001 |
| 578.64921 | -0.001 |
| 578.87751 | 0 |
| 579.10581 | -0.002 |
| 579.33413 | 0.001 |
| 579.56246 | -0.001 |
| 579.7908 | -0.001 |
| 580.01916 | 0.001 |
| 580.24752 | -0.001 |
| 580.4759 | 0.001 |
| 580.70429 | -0.001 |
| 580.93269 | 0 |
| 581.1611 | -0.001 |
| 581.38952 | 0.001 |
| 581.61796 | 0 |
| 581.84641 | 0.001 |
| 582.07487 | -0.002 |
| 582.30334 | 0.001 |
| 582.53182 | -0.001 |
| 582.76032 | 0 |
| 582.98882 | -0.001 |
| 583.21734 | 0.003 |
| 583.44587 | -0.001 |
| 583.67441 | 0.001 |
| 583.90297 | -0.001 |
| 584.13153 | 0.001 |
| 584.36011 | 0 |
| 584.58869 | 0.001 |
| 584.81729 | -0.001 |
| 585.04591 | -0.001 |
| 585.27453 | 0 |
| 585.50317 | 0 |
| 585.73181 | -0.001 |
| 585.96047 | 0.001 |
| 586.18914 | 0 |
| 586.41782 | 0 |
| 586.64652 | 0.001 |
| 586.87522 | 0.001 |
| 587.10394 | 0.001 |
| 587.33267 | 0.002 |
| 587.56141 | 0 |
| 587.79016 | 0 |
| 588.01892 | -0.001 |
| 588.2477 | 0.001 |
| 588.47648 | 0 |
| 588.70528 | 0 |
| 588.93409 | 0 |
| 589.16291 | 0.002 |
| 589.39175 | 0 |
| 589.62059 | 0.001 |
| 589.84945 | 0 |
| 590.07831 | 0.001 |
| 590.30719 | 0 |
| 590.53609 | 0 |
| 590.76499 | 0 |
| 590.9939 | 0.001 |
| 591.22283 | 0 |
| 591.45177 | 0.001 |
| 591.68072 | -0.002 |
| 591.90968 | 0.001 |
| 592.13865 | -0.001 |
| 592.36763 | 0.001 |
| 592.59663 | 0 |
| 592.82563 | 0.001 |
| 593.05465 | -0.001 |
| 593.28368 | 0 |
| 593.51272 | 0 |
| 593.74178 | 0.001 |
| 593.97084 | 0 |
| 594.19992 | 0.001 |
| 594.42901 | -0.002 |
| 594.65811 | 0.001 |
| 594.88722 | 0 |
| 595.11634 | 0.001 |
| 595.34547 | -0.001 |
| 595.57462 | 0 |
| 595.80377 | -0.001 |
| 596.03294 | 0.001 |
| 596.26212 | 0 |
| 596.49131 | 0.001 |
| 596.72052 | -0.001 |
| 596.94973 | 0 |
| 597.17896 | -0.001 |
| 597.40819 | 0 |
| 597.63744 | 0 |
| 597.8667 | 0 |
| 598.09597 | -0.001 |
| 598.32526 | 0.001 |
| 598.55455 | 0 |
| 598.78386 | 0.001 |
| 599.01318 | -0.001 |
| 599.2425 | 0 |
| 599.47185 | -0.001 |
| 599.7012 | 0 |
| 599.93056 | -0.001 |
| 600.15993 | 0.001 |
| 600.38932 | -0.002 |
| 600.61872 | 0.001 |
| 600.84813 | 0 |
| 601.07755 | 0 |
| 601.30698 | -0.001 |
| 601.53642 | 0 |
| 601.76588 | -0.001 |
| 601.99534 | 0 |
| 602.22482 | -0.001 |
| 602.45431 | 0 |
| 602.68381 | 0 |
| 602.91332 | 0 |
| 603.14284 | 0 |
| 603.37238 | 0 |
| 603.60192 | -0.001 |
| 603.83148 | 0.001 |
| 604.06105 | -0.001 |
| 604.29063 | 0 |
| 604.52022 | -0.001 |
| 604.74982 | 0 |
| 604.97944 | -0.001 |
| 605.20906 | 0.001 |
| 605.4387 | 0 |
| 605.66835 | 0.001 |
| 605.898 | -0.001 |
| 606.12768 | 0.001 |
| 606.35736 | -0.001 |
| 606.58705 | 0.001 |
| 606.81675 | 0 |
| 607.04647 | 0 |
| 607.2762 | -0.001 |
| 607.50594 | 0 |
| 607.73569 | -0.001 |
| 607.96545 | -0.001 |
| 608.19522 | 0 |
| 608.425 | 0 |
| 608.6548 | -0.001 |
| 608.8846 | 0.001 |
| 609.11442 | 0.001 |
| 609.34425 | 0 |
| 609.57409 | -0.001 |
| 609.80394 | 0.001 |
| 610.0338 | 0 |
| 610.26368 | 0.001 |
| 610.49356 | 0 |
| 610.72346 | 0 |
| 610.95336 | 0 |
| 611.18328 | 0.001 |
| 611.41321 | 0 |
| 611.64315 | 0.001 |
| 611.87311 | 0.001 |
| 612.10307 | 0 |
| 612.33304 | -0.001 |
| 612.56303 | 0 |
| 612.79303 | 0 |
| 613.02304 | 0 |
| 613.25306 | -0.001 |
| 613.48309 | 0 |
| 613.71313 | 0 |
| 613.94318 | 0 |
| 614.17325 | -0.001 |
| 614.40332 | 0 |
| 614.63341 | 0 |
| 614.86351 | 0 |
| 615.09362 | 0 |
| 615.32374 | 0 |
| 615.55387 | -0.001 |
| 615.78401 | -0.001 |
| 616.01416 | 0 |
| 616.24433 | 0.001 |
| 616.4745 | 0 |
| 616.70469 | 0.001 |
| 616.93489 | 0 |
| 617.1651 | 0.001 |
| 617.39532 | -0.001 |
| 617.62555 | 0.001 |
| 617.85579 | 0 |
| 618.08605 | 0 |
| 618.31631 | 0 |
| 618.54659 | 0 |
| 618.77688 | -0.002 |
| 619.00717 | 0.001 |
| 619.23748 | 0 |
| 619.4678 | 0.001 |
| 619.69814 | 0 |
| 619.92848 | 0 |
| 620.15883 | 0 |
| 620.3892 | 0 |
| 620.61957 | -0.001 |
| 620.84996 | 0.001 |
| 621.08036 | 0 |
| 621.31077 | 0 |
| 621.54119 | -0.001 |
| 621.77162 | 0 |
| 622.00206 | 0 |
| 622.23252 | 0.001 |
| 622.46298 | 0 |
| 622.69345 | 0.001 |
| 622.92394 | 0 |
| 623.15444 | 0 |
| 623.38495 | -0.001 |
| 623.61547 | 0 |
| 623.846 | 0 |
| 624.07654 | 0.001 |
| 624.30709 | -0.001 |
| 624.53766 | 0.001 |
| 624.76823 | 0 |
| 624.99882 | 0.001 |
| 625.22941 | -0.001 |
| 625.46002 | 0 |
| 625.69064 | -0.001 |
| 625.92127 | 0.001 |
| 626.15191 | -0.001 |
| 626.38256 | 0.001 |
| 626.61322 | -0.001 |
| 626.8439 | 0 |
| 627.07458 | -0.001 |
| 627.30528 | 0.002 |
| 627.53598 | 0.001 |
| 627.7667 | 0 |
| 627.99743 | -0.001 |
| 628.22817 | 0.001 |
| 628.45892 | -0.001 |
| 628.68968 | 0 |
| 628.92045 | 0 |
| 629.15123 | 0.001 |
| 629.38203 | -0.001 |
| 629.61283 | 0 |
| 629.84365 | 0 |
| 630.07447 | -0.001 |
| 630.30531 | -0.001 |
| 630.53616 | 0 |
| 630.76702 | 0 |
| 630.99789 | 0 |
| 631.22877 | -0.001 |
| 631.45966 | 0 |
| 631.69057 | -0.001 |
| 631.92148 | 0.001 |
| 632.1524 | -0.001 |
| 632.38334 | -0.001 |
| 632.61429 | -0.002 |
| 632.84524 | 0 |
| 633.07621 | -0.001 |
| 633.30719 | 0 |
| 633.53818 | 0 |
| 633.76918 | -0.001 |
| 634.00019 | -0.001 |
| 634.23121 | 0 |
| 634.46225 | -0.001 |
| 634.69329 | 0 |
| 634.92435 | -0.001 |
| 635.15541 | 0.002 |
| 635.38649 | -0.001 |
| 635.61758 | 0.001 |
| 635.84867 | 0 |
| 636.07978 | 0 |
| 636.3109 | 0 |
| 636.54203 | 0 |
| 636.77317 | 0 |
| 637.00433 | 0.001 |
| 637.23549 | -0.001 |
| 637.46666 | 0.001 |
| 637.69785 | 0 |
| 637.92904 | 0.001 |
| 638.16025 | -0.001 |
| 638.39146 | 0.001 |
| 638.62269 | 0 |
| 638.85393 | 0.001 |
| 639.08518 | 0.002 |
| 639.31644 | -0.001 |
| 639.54771 | 0.002 |
| 639.77899 | 0 |
| 640.01028 | 0.001 |
| 640.24159 | 0 |
| 640.4729 | 0.001 |
| 640.70422 | -0.001 |
| 640.93556 | 0.001 |
| 641.1669 | 0 |
| 641.39826 | 0.001 |
| 641.62963 | 0 |
| 641.86101 | 0.001 |
| 642.09239 | 0 |
| 642.32379 | 0.002 |
| 642.5552 | 0 |
| 642.78662 | 0.001 |
| 643.01805 | 0.001 |
| 643.2495 | 0.001 |
| 643.48095 | 0 |
| 643.71241 | -0.001 |
| 643.94389 | 0.001 |
| 644.17537 | 0 |
| 644.40687 | -0.002 |
| 644.63837 | 0 |
| 644.86989 | -0.002 |
| 645.10142 | 0 |
| 645.33295 | -0.001 |
| 645.5645 | 0.001 |
| 645.79606 | -0.001 |
| 646.02763 | 0.001 |
| 646.25921 | -0.001 |
| 646.4908 | 0.002 |
| 646.7224 | 0 |
| 646.95402 | 0.002 |
| 647.18564 | 0.001 |
| 647.41727 | 0.001 |
| 647.64892 | 0 |
| 647.88057 | -0.001 |
| 648.11224 | -0.001 |
| 648.34391 | 0.001 |
| 648.5756 | -0.002 |
| 648.8073 | 0.001 |
| 649.03901 | 0 |
| 649.27072 | 0.001 |
| 649.50245 | -0.001 |
| 649.73419 | 0 |
| 649.96594 | 0 |
| 650.1977 | 0.001 |
| 650.42947 | -0.001 |
| 650.66126 | 0 |
| 650.89305 | -0.002 |
| 651.12485 | 0.001 |
| 651.35666 | -0.002 |
| 651.58849 | 0.001 |
| 651.82032 | 0 |
| 652.05217 | 0 |
| 652.28402 | 0.001 |
| 652.51589 | 0.001 |
| 652.74776 | -0.001 |
| 652.97965 | 0.001 |
| 653.21155 | -0.001 |
| 653.44346 | 0.002 |
| 653.67538 | -0.001 |
| 653.90731 | 0 |
| 654.13924 | 0 |
| 654.37119 | 0.001 |
| 654.60316 | 0 |
| 654.83513 | 0.001 |
| 655.06711 | 0.001 |
| 655.2991 | 0.001 |
| 655.5311 | -0.001 |
| 655.76312 | 0.002 |
| 655.99514 | -0.001 |
| 656.22717 | 0 |
| 656.45922 | -0.001 |
| 656.69127 | 0 |
| 656.92334 | -0.001 |
| 657.15541 | 0.001 |
| 657.3875 | 0 |
| 657.61959 | 0 |
| 657.8517 | -0.001 |
| 658.08382 | 0 |
| 658.31595 | 0.001 |
| 658.54809 | 0 |
| 658.78023 | 0 |
| 659.01239 | 0.002 |
| 659.24456 | -0.001 |
| 659.47674 | 0.001 |
| 659.70893 | 0.001 |
| 659.94113 | 0.001 |
| 660.17334 | 0 |
| 660.40557 | 0 |
| 660.6378 | -0.001 |
| 660.87004 | 0.001 |
| 661.10229 | -0.001 |
| 661.33455 | 0 |
| 661.56683 | -0.001 |
| 661.79911 | 0.002 |
| 662.03141 | -0.001 |
| 662.26371 | 0.002 |
| 662.49603 | 0 |
| 662.72835 | 0 |
| 662.96069 | 0 |
| 663.19303 | 0.001 |
| 663.42539 | -0.001 |
| 663.65775 | 0.002 |
| 663.89013 | -0.001 |
| 664.12252 | 0 |
| 664.35492 | -0.001 |
| 664.58732 | 0 |
| 664.81974 | 0 |
| 665.05217 | 0 |
| 665.28461 | -0.001 |
| 665.51706 | 0.001 |
| 665.74952 | -0.001 |
| 665.98199 | 0.001 |
| 666.21447 | 0 |
| 666.44696 | 0 |
| 666.67946 | 0 |
| 666.91197 | 0.001 |
| 667.14449 | -0.001 |
| 667.37702 | 0.001 |
| 667.60956 | -0.001 |
| 667.84211 | 0.001 |
| 668.07467 | 0 |
| 668.30725 | 0.001 |
| 668.53983 | -0.001 |
| 668.77242 | 0.001 |
| 669.00502 | -0.001 |
| 669.23764 | 0.001 |
| 669.47026 | -0.001 |
| 669.7029 | 0 |
| 669.93554 | 0 |
| 670.16819 | 0 |
| 670.40086 | -0.002 |
| 670.63353 | 0 |
| 670.86622 | -0.001 |
| 671.09891 | 0 |
| 671.33162 | 0.001 |
| 671.56433 | 0 |
| 671.79706 | -0.001 |
| 672.02979 | 0.001 |
| 672.26254 | -0.001 |
| 672.4953 | -0.002 |
| 672.72806 | -0.002 |
| 672.96084 | 0.001 |
| 673.19362 | -0.001 |
| 673.42642 | 0 |
| 673.65923 | -0.001 |
| 673.89205 | 0.001 |
| 674.12487 | -0.001 |
| 674.35771 | 0 |
| 674.59056 | 0 |
| 674.82342 | 0.001 |
| 675.05628 | -0.001 |
| 675.28916 | 0.001 |
| 675.52205 | 0 |
| 675.75495 | -0.001 |
| 675.98786 | -0.001 |
| 676.22077 | 0.001 |
| 676.4537 | -0.001 |
| 676.68664 | 0.001 |
| 676.91959 | -0.001 |
| 677.15255 | 0.001 |
| 677.38552 | -0.001 |
| 677.6185 | 0.001 |
| 677.85149 | 0.001 |
| 678.08449 | 0 |
| 678.3175 | 0 |
| 678.55051 | 0.001 |
| 678.78354 | -0.001 |
| 679.01658 | 0 |
| 679.24963 | -0.001 |
| 679.48269 | 0 |
| 679.71576 | 0 |
| 679.94884 | 0 |
| 680.18193 | 0 |
| 680.41503 | 0 |
| 680.64814 | 0.001 |
| 680.88126 | 0.002 |
| 681.11439 | 0 |
| 681.34753 | 0 |
| 681.58068 | -0.001 |
| 681.81384 | 0.001 |
| 682.04701 | 0 |
| 682.28019 | 0 |
| 682.51338 | -0.001 |
| 682.74658 | 0.001 |
| 682.97979 | -0.001 |
| 683.21301 | 0.001 |
| 683.44624 | 0 |
| 683.67948 | 0 |
| 683.91273 | -0.001 |
| 684.14599 | 0 |
| 684.37926 | 0 |
| 684.61254 | 0.002 |
| 684.84583 | -0.001 |
| 685.07913 | 0.002 |
| 685.31244 | 0 |
| 685.54576 | 0.001 |
| 685.77909 | -0.001 |
| 686.01243 | 0 |
| 686.24578 | 0 |
| 686.47914 | 0.001 |
| 686.71251 | -0.002 |
| 686.94589 | 0.002 |
| 687.17928 | 0.001 |
| 687.41268 | 0.001 |
| 687.64609 | -0.001 |
| 687.87951 | 0 |
| 688.11294 | -0.001 |
| 688.34638 | 0.001 |
| 688.57982 | 0 |
| 688.81328 | 0.001 |
| 689.04675 | 0 |
| 689.28023 | 0.001 |
| 689.51372 | 0 |
| 689.74722 | 0.001 |
| 689.98073 | -0.001 |
| 690.21424 | 0 |
| 690.44777 | -0.001 |
| 690.68131 | 0 |
| 690.91486 | 0.001 |
| 691.14842 | 0 |
| 691.38198 | -0.001 |
| 691.61556 | 0 |
| 691.84915 | 0 |
| 692.08274 | 0 |
| 692.31635 | 0.001 |
| 692.54997 | 0 |
| 692.78359 | 0 |
| 693.01723 | 0.001 |
| 693.25088 | 0 |
| 693.48453 | 0.001 |
| 693.7182 | -0.001 |
| 693.95187 | 0 |
| 694.18556 | 0 |
| 694.41925 | 0 |
| 694.65296 | -0.001 |
| 694.88667 | 0.002 |
| 695.1204 | 0 |
| 695.35413 | 0 |
| 695.58788 | 0 |
| 695.82163 | 0.001 |
| 696.0554 | 0 |
| 696.28917 | 0 |
| 696.52295 | 0 |
| 696.75675 | -0.001 |
| 696.99055 | 0.001 |
| 697.22436 | 0.001 |
| 697.45818 | 0 |
| 697.69202 | 0 |
| 697.92586 | 0 |
| 698.15971 | 0 |
| 698.39357 | 0.001 |
| 698.62744 | 0.001 |
| 698.86132 | 0.001 |
| 699.09521 | -0.001 |
| 699.32911 | -0.001 |
| 699.56302 | 0.001 |
| 699.79694 | 0 |
| 700.03087 | 0.001 |
| 700.26481 | 0 |
| 700.49876 | -0.001 |
| 700.73272 | -0.001 |
| 700.96669 | -0.001 |
| 701.20066 | 0.001 |
| 701.43465 | 0 |
| 701.66865 | 0.001 |
| 701.90266 | -0.001 |
| 702.13667 | -0.003 |
| 702.3707 | -0.001 |
| 702.60473 | 0 |
| 702.83878 | -0.001 |
| 703.07284 | 0.001 |
| 703.3069 | 0 |
| 703.54097 | -0.001 |
| 703.77506 | -0.003 |
| 704.00915 | 0.002 |
| 704.24326 | -0.001 |
| 704.47737 | 0 |
| 704.71149 | -0.001 |
| 704.94562 | 0.001 |
| 705.17977 | 0.001 |
| 705.41392 | 0.001 |
| 705.64808 | -0.001 |
| 705.88225 | 0 |
| 706.11643 | -0.001 |
| 706.35062 | 0 |
| 706.58482 | -0.002 |
| 706.81903 | 0.002 |
| 707.05325 | -0.001 |
| 707.28748 | 0 |
| 707.52171 | 0 |
| 707.75596 | 0 |
| 707.99022 | -0.002 |
| 708.22449 | -0.001 |
| 708.45876 | -0.002 |
| 708.69305 | 0 |
| 708.92734 | -0.002 |
| 709.16165 | 0.001 |
| 709.39596 | -0.001 |
| 709.63029 | 0.002 |
| 709.86462 | 0 |
| 710.09896 | 0 |
| 710.33332 | -0.001 |
| 710.56768 | -0.001 |
| 710.80205 | -0.002 |
| 711.03643 | 0.001 |
| 711.27082 | 0 |
| 711.50522 | 0 |
| 711.73963 | 0.001 |
| 711.97405 | 0 |
| 712.20848 | -0.001 |
| 712.44292 | 0 |
| 712.67737 | 0.001 |
| 712.91182 | 0 |
| 713.14629 | -0.001 |
| 713.38077 | 0.002 |
| 713.61525 | 0 |
| 713.84975 | 0 |
| 714.08425 | 0 |
| 714.31876 | 0 |
| 714.55329 | -0.001 |
| 714.78782 | 0 |
| 715.02236 | 0 |
| 715.25692 | 0 |
| 715.49148 | -0.002 |
| 715.72605 | 0.001 |
| 715.96063 | -0.001 |
| 716.19522 | 0.002 |
| 716.42982 | 0 |
| 716.66443 | 0.001 |
| 716.89904 | 0 |
| 717.13367 | -0.001 |
| 717.36831 | 0.002 |
| 717.60295 | 0.001 |
| 717.83761 | 0.001 |
| 718.07227 | 0 |
| 718.30695 | 0 |
| 718.54163 | 0 |
| 718.77633 | 0 |
| 719.01103 | 0 |
| 719.24574 | -0.001 |
| 719.48046 | 0.001 |
| 719.71519 | -0.001 |
| 719.94993 | 0.002 |
| 720.18468 | 0 |
| 720.41944 | 0 |
| 720.65421 | 0 |
| 720.88899 | -0.001 |
| 721.12377 | -0.002 |
| 721.35857 | 0.001 |
| 721.59337 | -0.001 |
| 721.82819 | 0.001 |
| 722.06301 | 0 |
| 722.29785 | 0.001 |
| 722.53269 | 0.002 |
| 722.76754 | 0.001 |
| 723.0024 | -0.001 |
| 723.23727 | 0 |
| 723.47216 | 0.001 |
| 723.70704 | 0.002 |
| 723.94194 | -0.001 |
| 724.17685 | 0.001 |
| 724.41177 | 0 |
| 724.6467 | 0.001 |
| 724.88163 | 0.001 |
| 725.11658 | 0.001 |
| 725.35153 | -0.001 |
| 725.58649 | 0 |
| 725.82147 | 0.001 |
| 726.05645 | 0.001 |
| 726.29144 | 0 |
| 726.52644 | 0.001 |
| 726.76145 | -0.001 |
| 726.99647 | 0.001 |
| 727.2315 | -0.001 |
| 727.46654 | 0.001 |
| 727.70158 | -0.002 |
| 727.93664 | 0.003 |
| 728.17171 | 0.002 |
| 728.40678 | 0.001 |
| 728.64187 | -0.001 |
| 728.87696 | 0.002 |
| 729.11206 | 0 |
| 729.34717 | 0.001 |
| 729.58229 | 0.001 |
| 729.81742 | 0.001 |
| 730.05256 | -0.001 |
| 730.28771 | 0.001 |
| 730.52287 | 0 |
| 730.75804 | 0.001 |
| 730.99321 | -0.001 |
| 731.2284 | 0.002 |
| 731.46359 | 0.002 |
| 731.69879 | 0.001 |
| 731.93401 | 0 |
| 732.16923 | 0.001 |
| 732.40446 | 0 |
| 732.6397 | 0.001 |
| 732.87495 | 0 |
| 733.11021 | 0.001 |
| 733.34547 | 0 |
| 733.58075 | 0.002 |
| 733.81604 | -0.001 |
| 734.05133 | 0.001 |
| 734.28664 | 0 |
| 734.52195 | 0.003 |
| 734.75727 | 0 |
| 734.9926 | 0.001 |
| 735.22794 | 0.001 |
| 735.46329 | 0.002 |
| 735.69865 | 0 |
| 735.93402 | 0.001 |
| 736.1694 | 0 |
| 736.40478 | 0.001 |
| 736.64018 | 0 |
| 736.87558 | 0.001 |
| 737.111 | 0.001 |
| 737.34642 | 0.003 |
| 737.58185 | 0.001 |
| 737.81729 | 0.003 |
| 738.05274 | 0.002 |
| 738.2882 | 0.003 |
| 738.52367 | 0.001 |
| 738.75914 | 0.003 |
| 738.99463 | -0.001 |
| 739.23012 | 0.004 |
| 739.46563 | 0.002 |
| 739.70114 | 0.003 |
| 739.93666 | 0.003 |
| 740.17219 | 0.004 |
| 740.40773 | 0.003 |
| 740.64328 | 0.003 |
| 740.87884 | 0.004 |
| 741.11441 | 0.003 |
| 741.34998 | 0.004 |
| 741.58557 | 0.005 |
| 741.82116 | 0.003 |
| 742.05676 | 0.005 |
| 742.29238 | 0.004 |
| 742.528 | 0.006 |
| 742.76363 | 0.004 |
| 742.99927 | 0.007 |
| 743.23491 | 0.004 |
| 743.47057 | 0.006 |
| 743.70624 | 0.006 |
| 743.94191 | 0.005 |
| 744.1776 | 0.006 |
| 744.41329 | 0.008 |
| 744.64899 | 0.005 |
| 744.8847 | 0.007 |
| 745.12042 | 0.007 |
| 745.35615 | 0.009 |
| 745.59189 | 0.008 |
| 745.82763 | 0.01 |
| 746.06339 | 0.01 |
| 746.29915 | 0.011 |
| 746.53493 | 0.011 |
| 746.77071 | 0.011 |
| 747.0065 | 0.01 |
| 747.2423 | 0.012 |
| 747.47811 | 0.01 |
| 747.71393 | 0.012 |
| 747.94975 | 0.012 |
| 748.18559 | 0.012 |
| 748.42143 | 0.014 |
| 748.65728 | 0.014 |
| 748.89315 | 0.014 |
| 749.12902 | 0.015 |
| 749.3649 | 0.017 |
| 749.60079 | 0.018 |
| 749.83668 | 0.016 |
| 750.07259 | 0.017 |
| 750.30851 | 0.016 |
| 750.54443 | 0.019 |
| 750.78036 | 0.018 |
| 751.0163 | 0.021 |
| 751.25226 | 0.019 |
| 751.48821 | 0.023 |
| 751.72418 | 0.022 |
| 751.96016 | 0.021 |
| 752.19615 | 0.022 |
| 752.43214 | 0.024 |
| 752.66814 | 0.024 |
| 752.90416 | 0.026 |
| 753.14018 | 0.023 |
| 753.37621 | 0.028 |
| 753.61225 | 0.026 |
| 753.8483 | 0.027 |
| 754.08435 | 0.029 |
| 754.32042 | 0.031 |
| 754.55649 | 0.029 |
| 754.79257 | 0.032 |
| 755.02867 | 0.032 |
| 755.26477 | 0.035 |
| 755.50087 | 0.031 |
| 755.73699 | 0.035 |
| 755.97312 | 0.035 |
| 756.20925 | 0.036 |
| 756.4454 | 0.038 |
| 756.68155 | 0.038 |
| 756.91771 | 0.039 |
| 757.15388 | 0.039 |
| 757.39006 | 0.041 |
| 757.62625 | 0.043 |
| 757.86245 | 0.043 |
| 758.09865 | 0.044 |
| 758.33487 | 0.046 |
| 758.57109 | 0.046 |
| 758.80732 | 0.048 |
| 759.04356 | 0.047 |
| 759.27981 | 0.051 |
| 759.51607 | 0.052 |
| 759.75233 | 0.053 |
| 759.98861 | 0.053 |
| 760.22489 | 0.056 |
| 760.46118 | 0.055 |
| 760.69748 | 0.056 |
| 760.93379 | 0.057 |
| 761.17011 | 0.063 |
| 761.40644 | 0.06 |
| 761.64278 | 0.063 |
| 761.87912 | 0.062 |
| 762.11547 | 0.064 |
| 762.35183 | 0.065 |
| 762.5882 | 0.067 |
| 762.82458 | 0.066 |
| 763.06097 | 0.068 |
| 763.29737 | 0.069 |
| 763.53377 | 0.075 |
| 763.77019 | 0.075 |
| 764.00661 | 0.077 |
| 764.24304 | 0.076 |
| 764.47948 | 0.08 |
| 764.71593 | 0.079 |
| 764.95238 | 0.081 |
| 765.18885 | 0.083 |
| 765.42532 | 0.084 |
| 765.6618 | 0.086 |
| 765.89829 | 0.087 |
| 766.13479 | 0.091 |
| 766.3713 | 0.091 |
| 766.60782 | 0.091 |
| 766.84434 | 0.094 |
| 767.08088 | 0.095 |
| 767.31742 | 0.1 |
| 767.55397 | 0.099 |
| 767.79053 | 0.103 |
| 768.0271 | 0.103 |
| 768.26367 | 0.108 |
| 768.50026 | 0.105 |
| 768.73685 | 0.11 |
| 768.97346 | 0.108 |
| 769.21007 | 0.113 |
| 769.44669 | 0.113 |
| 769.68331 | 0.117 |
| 769.91995 | 0.117 |
| 770.15659 | 0.121 |
| 770.39325 | 0.121 |
| 770.62991 | 0.123 |
| 770.86658 | 0.127 |
| 771.10326 | 0.128 |
| 771.33995 | 0.133 |
| 771.57664 | 0.133 |
| 771.81335 | 0.131 |
| 772.05006 | 0.139 |
| 772.28678 | 0.14 |
| 772.52351 | 0.146 |
| 772.76025 | 0.146 |
| 772.997 | 0.147 |
| 773.23375 | 0.153 |
| 773.47052 | 0.152 |
| 773.70729 | 0.155 |
| 773.94407 | 0.157 |
| 774.18086 | 0.156 |
| 774.41765 | 0.163 |
| 774.65446 | 0.166 |
| 774.89127 | 0.168 |
| 775.1281 | 0.169 |
| 775.36493 | 0.172 |
| 775.60177 | 0.174 |
| 775.83862 | 0.178 |
| 776.07547 | 0.186 |
| 776.31234 | 0.184 |
| 776.54921 | 0.188 |
| 776.78609 | 0.191 |
| 777.02298 | 0.194 |
| 777.25988 | 0.201 |
| 777.49679 | 0.197 |
| 777.7337 | 0.205 |
| 777.97063 | 0.205 |
| 778.20756 | 0.216 |
| 778.4445 | 0.214 |
| 778.68145 | 0.22 |
| 778.91841 | 0.218 |
| 779.15537 | 0.22 |
| 779.39235 | 0.225 |
| 779.62933 | 0.232 |
| 779.86632 | 0.239 |
| 780.10332 | 0.238 |
| 780.34033 | 0.241 |
| 780.57734 | 0.245 |
| 780.81437 | 0.246 |
| 781.0514 | 0.255 |
| 781.28844 | 0.257 |
| 781.52549 | 0.262 |
| 781.76255 | 0.266 |
| 781.99961 | 0.269 |
| 782.23669 | 0.27 |
| 782.47377 | 0.277 |
| 782.71086 | 0.284 |
| 782.94796 | 0.28 |
| 783.18507 | 0.287 |
| 783.42218 | 0.297 |
| 783.6593 | 0.299 |
| 783.89644 | 0.308 |
| 784.13358 | 0.304 |
| 784.37073 | 0.312 |
| 784.60788 | 0.316 |
| 784.84505 | 0.322 |
| 785.08222 | 0.322 |
| 785.3194 | 0.329 |
| 785.55659 | 0.331 |
| 785.79379 | 0.34 |
| 786.031 | 0.344 |
| 786.26821 | 0.349 |
| 786.50544 | 0.351 |
| 786.74267 | 0.358 |
| 786.97991 | 0.357 |
| 787.21716 | 0.367 |
| 787.45441 | 0.367 |
| 787.69168 | 0.375 |
| 787.92895 | 0.378 |
| 788.16623 | 0.389 |
| 788.40352 | 0.393 |
| 788.64081 | 0.396 |
| 788.87812 | 0.402 |
| 789.11543 | 0.412 |
| 789.35275 | 0.412 |
| 789.59008 | 0.417 |
| 789.82742 | 0.424 |
| 790.06477 | 0.429 |
| 790.30212 | 0.434 |
| 790.53949 | 0.448 |
| 790.77686 | 0.443 |
| 791.01424 | 0.453 |
| 791.25162 | 0.456 |
| 791.48902 | 0.468 |
| 791.72642 | 0.476 |
| 791.96383 | 0.475 |
| 792.20125 | 0.478 |
| 792.43868 | 0.495 |
| 792.67612 | 0.493 |
| 792.91356 | 0.496 |
| 793.15101 | 0.508 |
| 793.38847 | 0.518 |
| 793.62594 | 0.521 |
| 793.86342 | 0.522 |
| 794.1009 | 0.533 |
| 794.3384 | 0.542 |
| 794.5759 | 0.543 |
| 794.81341 | 0.556 |
| 795.05092 | 0.562 |
| 795.28845 | 0.57 |
| 795.52598 | 0.572 |
| 795.76352 | 0.579 |
| 796.00107 | 0.598 |
| 796.23863 | 0.599 |
| 796.4762 | 0.606 |
| 796.71377 | 0.615 |
| 796.95135 | 0.617 |
| 797.18894 | 0.625 |
| 797.42654 | 0.632 |
| 797.66415 | 0.646 |
| 797.90176 | 0.653 |
| 798.13938 | 0.659 |
| 798.37701 | 0.669 |
| 798.61465 | 0.683 |
| 798.8523 | 0.68 |
| 799.08995 | 0.699 |
| 799.32761 | 0.702 |
| 799.56528 | 0.714 |
| 799.80296 | 0.716 |
| 800.04065 | 0.729 |
| 800.27834 | 0.741 |
| 800.51605 | 0.738 |
| 800.75376 | 0.746 |
| 800.99147 | 0.766 |
| 801.2292 | 0.775 |
| 801.46694 | 0.776 |
| 801.70468 | 0.791 |
| 801.94243 | 0.799 |
| 802.18019 | 0.802 |
| 802.41795 | 0.811 |
| 802.65573 | 0.812 |
| 802.89351 | 0.829 |
| 803.1313 | 0.841 |
| 803.3691 | 0.851 |
| 803.6069 | 0.859 |
| 803.84472 | 0.858 |
| 804.08254 | 0.861 |
| 804.32037 | 0.873 |
| 804.55821 | 0.882 |
| 804.79605 | 0.882 |
| 805.03391 | 0.9 |
| 805.27177 | 0.901 |
| 805.50964 | 0.897 |
| 805.74752 | 0.911 |
| 805.9854 | 0.922 |
| 806.2233 | 0.919 |
| 806.4612 | 0.93 |
| 806.69911 | 0.937 |
| 806.93702 | 0.94 |
| 807.17495 | 0.953 |
| 807.41288 | 0.95 |
| 807.65082 | 0.967 |
| 807.88877 | 0.958 |
| 808.12673 | 0.96 |
| 808.36469 | 0.971 |
| 808.60266 | 0.972 |
| 808.84064 | 0.979 |
| 809.07863 | 0.976 |
| 809.31663 | 0.984 |
| 809.55463 | 0.987 |
| 809.79264 | 0.989 |
| 810.03066 | 0.988 |
| 810.26869 | 0.989 |
| 810.50672 | 0.985 |
| 810.74477 | 0.993 |
| 810.98282 | 0.991 |
| 811.22088 | 1 |
| 811.45894 | 0.992 |
| 811.69702 | 0.998 |
| 811.9351 | 0.996 |
| 812.17319 | 0.998 |
| 812.41129 | 0.998 |
| 812.64939 | 0.99 |
| 812.88751 | 0.991 |
| 813.12563 | 0.996 |
| 813.36376 | 0.995 |
| 813.60189 | 0.989 |
| 813.84004 | 0.981 |
| 814.07819 | 0.989 |
| 814.31635 | 0.973 |
| 814.55452 | 0.976 |
| 814.79269 | 0.97 |
| 815.03088 | 0.968 |
| 815.26907 | 0.959 |
| 815.50727 | 0.953 |
| 815.74547 | 0.953 |
| 815.98369 | 0.948 |
| 816.22191 | 0.939 |
| 816.46014 | 0.929 |
| 816.69838 | 0.925 |
| 816.93662 | 0.916 |
| 817.17488 | 0.905 |
| 817.41314 | 0.893 |
| 817.65141 | 0.887 |
| 817.88968 | 0.877 |
| 818.12797 | 0.865 |
| 818.36626 | 0.866 |
| 818.60456 | 0.857 |
| 818.84286 | 0.84 |
| 819.08118 | 0.828 |
| 819.3195 | 0.804 |
| 819.55783 | 0.796 |
| 819.79617 | 0.771 |
| 820.03451 | 0.762 |
| 820.27287 | 0.746 |
| 820.51123 | 0.733 |
| 820.7496 | 0.718 |
| 820.98797 | 0.71 |
| 821.22636 | 0.686 |
| 821.46475 | 0.677 |
| 821.70315 | 0.655 |
| 821.94155 | 0.637 |
| 822.17997 | 0.621 |
| 822.41839 | 0.615 |
| 822.65682 | 0.595 |
| 822.89526 | 0.582 |
| 823.1337 | 0.568 |
| 823.37216 | 0.552 |
| 823.61062 | 0.543 |
| 823.84908 | 0.523 |
| 824.08756 | 0.5 |
| 824.32604 | 0.488 |
| 824.56453 | 0.471 |
| 824.80303 | 0.464 |
| 825.04154 | 0.443 |
| 825.28005 | 0.429 |
| 825.51857 | 0.416 |
| 825.7571 | 0.406 |
| 825.99564 | 0.394 |
| 826.23418 | 0.384 |
| 826.47273 | 0.37 |
| 826.71129 | 0.362 |
| 826.94986 | 0.339 |
| 827.18843 | 0.333 |
| 827.42701 | 0.324 |
| 827.6656 | 0.311 |
| 827.9042 | 0.302 |
| 828.1428 | 0.291 |
| 828.38141 | 0.282 |
| 828.62003 | 0.27 |
| 828.85866 | 0.262 |
| 829.0973 | 0.252 |
| 829.33594 | 0.241 |
| 829.57459 | 0.228 |
| 829.81324 | 0.222 |
| 830.05191 | 0.217 |
| 830.29058 | 0.214 |
| 830.52926 | 0.2 |
| 830.76795 | 0.2 |
| 831.00664 | 0.191 |
| 831.24534 | 0.184 |
| 831.48405 | 0.178 |
| 831.72277 | 0.172 |
| 831.96149 | 0.163 |
| 832.20023 | 0.161 |
| 832.43897 | 0.154 |
| 832.67771 | 0.151 |
| 832.91647 | 0.143 |
| 833.15523 | 0.14 |
| 833.394 | 0.131 |
| 833.63277 | 0.13 |
| 833.87156 | 0.126 |
| 834.11035 | 0.121 |
| 834.34915 | 0.113 |
| 834.58796 | 0.113 |
| 834.82677 | 0.105 |
| 835.06559 | 0.105 |
| 835.30442 | 0.103 |
| 835.54326 | 0.098 |
| 835.7821 | 0.094 |
| 836.02095 | 0.094 |
| 836.25981 | 0.086 |
| 836.49867 | 0.085 |
| 836.73755 | 0.081 |
| 836.97643 | 0.081 |
| 837.21532 | 0.076 |
| 837.45421 | 0.074 |
| 837.69311 | 0.072 |
| 837.93203 | 0.071 |
| 838.17094 | 0.065 |
| 838.40987 | 0.066 |
| 838.6488 | 0.063 |
| 838.88774 | 0.059 |
| 839.12669 | 0.062 |
| 839.36564 | 0.059 |
| 839.6046 | 0.056 |
| 839.84357 | 0.055 |
| 840.08255 | 0.048 |
| 840.32153 | 0.052 |
| 840.56052 | 0.048 |
| 840.79952 | 0.046 |
| 841.03853 | 0.045 |
| 841.27754 | 0.045 |
| 841.51656 | 0.043 |
| 841.75559 | 0.044 |
| 841.99462 | 0.042 |
| 842.23367 | 0.04 |
| 842.47272 | 0.04 |
| 842.71177 | 0.039 |
| 842.95084 | 0.036 |
| 843.18991 | 0.036 |
| 843.42899 | 0.035 |
| 843.66807 | 0.034 |
| 843.90717 | 0.032 |
| 844.14627 | 0.031 |
| 844.38538 | 0.031 |
| 844.62449 | 0.032 |
| 844.86361 | 0.029 |
| 845.10274 | 0.028 |
| 845.34188 | 0.028 |
| 845.58102 | 0.028 |
| 845.82018 | 0.026 |
| 846.05934 | 0.025 |
| 846.2985 | 0.025 |
| 846.53767 | 0.023 |
| 846.77685 | 0.023 |
| 847.01604 | 0.022 |
| 847.25524 | 0.02 |
| 847.49444 | 0.022 |
| 847.73365 | 0.021 |
| 847.97287 | 0.02 |
| 848.21209 | 0.021 |
| 848.45132 | 0.02 |
| 848.69056 | 0.02 |
| 848.9298 | 0.016 |
| 849.16906 | 0.015 |
| 849.40832 | 0.019 |
| 849.64758 | 0.018 |
| 849.88686 | 0.017 |
| 850.12614 | 0.014 |
| 850.36543 | 0.014 |
| 850.60472 | 0.015 |
| 850.84403 | 0.014 |
| 851.08334 | 0.012 |
| 851.32265 | 0.012 |
| 851.56198 | 0.014 |
| 851.80131 | 0.016 |
| 852.04065 | 0.012 |
| 852.27999 | 0.014 |
| 852.51935 | 0.009 |
| 852.75871 | 0.011 |
| 852.99807 | 0.014 |
| 853.23745 | 0.013 |
| 853.47683 | 0.011 |
| 853.71622 | 0.011 |
| 853.95561 | 0.009 |
| 854.19502 | 0.01 |
| 854.43443 | 0.009 |
| 854.67384 | 0.011 |
| 854.91327 | 0.009 |
| 855.1527 | 0.011 |
| 855.39214 | 0.008 |
| 855.63158 | 0.01 |
| 855.87103 | 0.009 |
| 856.11049 | 0.008 |
| 856.34996 | 0.007 |
| 856.58943 | 0.005 |
| 856.82892 | 0.006 |
| 857.0684 | 0.006 |
| 857.3079 | 0.006 |
| 857.5474 | 0.009 |
| 857.78691 | 0.007 |
| 858.02642 | 0.009 |
| 858.26595 | 0.005 |
| 858.50548 | 0.008 |
| 858.74502 | 0.005 |
| 858.98456 | 0.007 |
| 859.22411 | 0.007 |
| 859.46367 | 0.006 |
| 859.70323 | 0.007 |
| 859.94281 | 0.007 |
| 860.18239 | 0.006 |
| 860.42197 | 0.008 |
| 860.66156 | 0.004 |
| 860.90116 | 0.009 |
| 861.14077 | 0.007 |
| 861.38039 | 0.008 |
| 861.62001 | 0.003 |
| 861.85964 | 0.007 |
| 862.09927 | 0.005 |
| 862.33891 | 0.008 |
| 862.57856 | 0.001 |
| 862.81822 | 0.007 |
| 863.05788 | 0.003 |
| 863.29755 | 0.007 |
| 863.53723 | 0.002 |
| 863.77691 | 0.005 |
| 864.0166 | 0.004 |
| 864.2563 | 0.005 |
| 864.49601 | 0.003 |
| 864.73572 | 0.005 |
| 864.97544 | 0 |
| 865.21516 | 0.003 |
| 865.45489 | 0.002 |
| 865.69463 | 0.006 |
| 865.93438 | 0.003 |
| 866.17413 | 0.005 |
| 866.41389 | 0.002 |
| 866.65366 | 0.004 |
| 866.89343 | 0.001 |
| 867.13321 | 0.004 |
| 867.373 | 0.004 |
| 867.6128 | 0.004 |
| 867.8526 | 0.002 |
| 868.09241 | 0.003 |
| 868.33222 | 0.001 |
| 868.57204 | 0.006 |
| 868.81187 | 0.004 |
| 869.05171 | 0.005 |
| 869.29155 | 0.002 |
| 869.5314 | 0.005 |
| 869.77126 | 0.002 |
| 870.01112 | 0.002 |
| 870.25099 | 0.005 |
| 870.49087 | 0.002 |
| 870.73075 | -0.001 |
| 870.97064 | 0.007 |
| 871.21054 | 0.002 |
| 871.45044 | 0 |
| 871.69035 | 0 |
| 871.93027 | 0.003 |
| 872.1702 | -0.002 |
| 872.41013 | 0.004 |
| 872.65007 | 0.001 |
| 872.89001 | 0.003 |
| 873.12996 | -0.003 |
| 873.36992 | 0.003 |
| 873.60989 | -0.002 |
| 873.84986 | 0.003 |
| 874.08984 | 0 |
| 874.32982 | 0.003 |
| 874.56982 | 0.002 |
| 874.80982 | -0.002 |
| 875.04982 | 0.002 |
| 875.28983 | 0.001 |
| 875.52985 | -0.005 |
| 875.76988 | 0.005 |
| 876.00991 | 0 |
| 876.24995 | 0 |
| 876.49 | -0.001 |
| 876.73005 | 0.001 |
| 876.97011 | 0 |
| 877.21018 | 0.004 |
| 877.45025 | -0.001 |
| 877.69033 | 0.006 |
| 877.93042 | -0.003 |
| 878.17051 | 0.002 |
| 878.41061 | -0.001 |
| 878.65072 | 0.002 |
| 878.89084 | 0 |
| 879.13096 | 0.002 |
| 879.37108 | -0.004 |
| 879.61122 | 0.005 |
| 879.85136 | 0.001 |
| 880.0915 | 0.004 |
| 880.33166 | 0 |
| 880.57182 | 0 |
| 880.81199 | 0.002 |
| 881.05216 | 0.002 |
| 881.29234 | 0 |
| 881.53253 | 0 |
| 881.77272 | -0.001 |
| 882.01292 | -0.003 |
| 882.25313 | 0.006 |
| 882.49334 | -0.005 |
| 882.73356 | -0.001 |
| 882.97379 | 0 |
| 883.21402 | 0.001 |
| 883.45426 | 0 |
| 883.69451 | 0.002 |
| 883.93476 | 0 |
| 884.17502 | 0.003 |
| 884.41529 | -0.002 |
| 884.65556 | 0.002 |
| 884.89584 | -0.001 |
| 885.13613 | -0.002 |
| 885.37642 | -0.001 |
| 885.61672 | 0.002 |
| 885.85703 | -0.001 |
| 886.09734 | 0 |
| 886.33766 | -0.004 |
| 886.57799 | 0 |
| 886.81832 | -0.003 |
| 887.05866 | 0.001 |
| 887.29901 | -0.004 |
| 887.53936 | 0.004 |
| 887.77972 | -0.004 |
| 888.02008 | 0.003 |
| 888.26045 | 0.001 |
| 888.50083 | 0.006 |
| 888.74122 | -0.002 |
| 888.98161 | 0.002 |
| 889.22201 | -0.001 |
| 889.46241 | 0.001 |
| 889.70282 | 0.001 |
| 889.94324 | 0.001 |
| 890.18366 | 0 |
| 890.42409 | 0 |
| 890.66453 | 0.001 |
| 890.90497 | 0.003 |
| 891.14542 | 0.005 |
| 891.38588 | -0.001 |
| 891.62634 | -0.005 |
| 891.86681 | 0.006 |
| 892.10729 | -0.004 |
| 892.34777 | 0.004 |
| 892.58826 | 0.003 |
| 892.82876 | 0.001 |
| 893.06926 | -0.002 |
| 893.30977 | 0.004 |
| 893.55028 | -0.005 |
| 893.7908 | 0 |
| 894.03133 | -0.001 |
| 894.27186 | 0.003 |
| 894.51241 | 0.001 |
| 894.75295 | 0.006 |
| 894.99351 | 0.001 |
| 895.23407 | 0.004 |
| 895.47463 | -0.002 |
| 895.7152 | 0.006 |
| 895.95578 | 0.006 |
| 896.19637 | 0.005 |
| 896.43696 | -0.002 |
| 896.67756 | 0.005 |
| 896.91816 | -0.002 |
| 897.15878 | 0.002 |
| 897.39939 | 0 |
| 897.64002 | 0.001 |
| 897.88065 | -0.002 |
| 898.12128 | 0 |
| 898.36193 | 0.002 |
| 898.60258 | 0.003 |
| 898.84323 | -0.001 |
| 899.08389 | -0.002 |
| 899.32456 | 0.002 |
| 899.56524 | 0.003 |
| 899.80592 | 0 |
| 900.04661 | 0.001 |
| 900.2873 | -0.004 |
| 900.528 | 0.003 |
| 900.76871 | -0.007 |
| 901.00942 | 0.004 |
| 901.25014 | 0.002 |
| 901.49087 | -0.002 |
| 901.7316 | -0.001 |
| 901.97234 | -0.002 |
| 902.21308 | 0 |
| 902.45383 | 0.001 |
| 902.69459 | -0.004 |
| 902.93535 | 0.002 |
| 903.17612 | 0.002 |
| 903.4169 | 0.003 |
| 903.65768 | 0.002 |
| 903.89847 | 0.007 |
| 904.13926 | -0.002 |
| 904.38006 | 0.001 |
| 904.62087 | -0.002 |
| 904.86169 | 0 |
| 905.10251 | -0.002 |
| 905.34333 | 0.004 |
| 905.58416 | -0.008 |
| 905.825 | -0.005 |
| 906.06585 | -0.001 |
| 906.3067 | 0 |
| 906.54756 | -0.006 |
| 906.78842 | 0.003 |
| 907.02929 | -0.006 |
| 907.27017 | 0.003 |
| 907.51105 | -0.004 |
| 907.75194 | 0 |
| 907.99283 | 0.002 |
| 908.23373 | 0.004 |
| 908.47464 | -0.002 |
| 908.71555 | 0.004 |
| 908.95647 | -0.005 |
| 909.1974 | 0.005 |
| 909.43833 | -0.005 |
| 909.67927 | 0.002 |
| 909.92021 | -0.007 |
| 910.16116 | 0.001 |
| 910.40212 | 0.003 |
| 910.64308 | 0.006 |
| 910.88405 | -0.007 |
| 911.12503 | 0.005 |
| 911.36601 | -0.004 |
| 911.607 | 0.002 |
| 911.84799 | 0 |
| 912.08899 | 0.001 |
| 912.33 | 0 |
| 912.57101 | 0.005 |
| 912.81203 | -0.003 |
| 913.05305 | -0.001 |
| 913.29408 | -0.005 |
| 913.53512 | -0.003 |
| 913.77616 | -0.005 |
| 914.01721 | 0.001 |
| 914.25827 | -0.002 |
| 914.49933 | 0.009 |
| 914.74039 | 0.001 |
| 914.98147 | 0.002 |
| 915.22255 | 0 |
| 915.46363 | 0.004 |
| 915.70472 | 0.003 |
| 915.94582 | 0.005 |
| 916.18693 | 0.003 |
| 916.42804 | 0 |
| 916.66915 | -0.004 |
| 916.91027 | 0.003 |
| 917.1514 | 0.001 |
| 917.39254 | 0.006 |
| 917.63368 | -0.003 |
| 917.87482 | -0.005 |
| 918.11597 | -0.004 |
| 918.35713 | 0.004 |
| 918.5983 | -0.005 |
| 918.83947 | 0.001 |
| 919.08064 | -0.005 |
| 919.32183 | 0 |
| 919.56301 | 0.005 |
| 919.80421 | 0.002 |
| 920.04541 | 0 |
| 920.28662 | 0.006 |
| 920.52783 | 0.001 |
| 920.76905 | 0.005 |
| 921.01027 | 0.001 |
| 921.2515 | 0.004 |
| 921.49274 | 0.001 |
| 921.73398 | 0.008 |
| 921.97523 | -0.005 |
| 922.21648 | 0.001 |
| 922.45774 | -0.004 |
| 922.69901 | 0.002 |
| 922.94028 | -0.005 |
| 923.18156 | 0.006 |
| 923.42285 | -0.002 |
| 923.66414 | 0.001 |
| 923.90543 | -0.001 |
| 924.14673 | 0.002 |
| 924.38804 | 0.001 |
| 924.62936 | -0.001 |
| 924.87068 | -0.002 |
| 925.112 | 0.004 |
| 925.35333 | -0.007 |
| 925.59467 | 0.003 |
| 925.83602 | -0.003 |
| 926.07737 | 0.005 |
| 926.31872 | 0.005 |
| 926.56008 | 0.007 |
| 926.80145 | -0.002 |
| 927.04282 | 0.003 |
| 927.2842 | 0.001 |
| 927.52559 | 0 |
| 927.76698 | 0 |
| 928.00837 | 0.006 |
| 928.24978 | -0.001 |
| 928.49119 | 0.004 |
| 928.7326 | 0.001 |
| 928.97402 | -0.001 |
| 929.21545 | -0.003 |
| 929.45688 | -0.004 |
| 929.69832 | 0.004 |
| 929.93976 | 0.001 |
| 930.18121 | -0.001 |
| 930.42267 | -0.005 |
| 930.66413 | 0.003 |
| 930.90559 | 0.004 |
| 931.14707 | -0.002 |
| 931.38855 | 0.009 |
| 931.63003 | -0.002 |
| 931.87152 | 0.005 |
| 932.11302 | -0.001 |
| 932.35452 | 0.002 |
| 932.59603 | 0 |
| 932.83754 | 0.006 |
| 933.07906 | 0.002 |
| 933.32059 | 0.003 |
| 933.56212 | -0.01 |
| 933.80365 | -0.002 |
| 934.0452 | -0.009 |
| 934.28674 | -0.006 |
| 934.5283 | -0.005 |
| 934.76986 | 0.005 |
| 935.01142 | -0.007 |
| 935.253 | 0.008 |
| 935.49457 | -0.003 |
| 935.73616 | 0.004 |
| 935.97774 | -0.003 |
| 936.21934 | 0.005 |
| 936.46094 | 0.001 |
| 936.70254 | 0.007 |
| 936.94416 | 0 |
| 937.18577 | -0.002 |
| 937.4274 | 0 |
| 937.66903 | 0 |
| 937.91066 | -0.005 |
| 938.1523 | -0.004 |
| 938.39395 | -0.006 |
| 938.6356 | 0.002 |
| 938.87726 | -0.005 |
| 939.11892 | 0.008 |
| 939.36059 | -0.007 |
| 939.60226 | 0.001 |
| 939.84394 | -0.003 |
| 940.08563 | 0 |
| 940.32732 | 0.001 |
| 940.56902 | 0.005 |
| 940.81072 | -0.007 |
| 941.05243 | -0.004 |
| 941.29414 | -0.008 |
| 941.53586 | 0.008 |
| 941.77759 | 0 |
| 942.01932 | 0.009 |
| 942.26106 | 0.006 |
| 942.5028 | -0.006 |
| 942.74455 | 0.003 |
| 942.9863 | 0.001 |
| 943.22806 | 0.003 |
| 943.46983 | -0.008 |
| 943.7116 | -0.001 |
| 943.95337 | -0.006 |
| 944.19516 | 0.003 |
| 944.43694 | -0.005 |
| 944.67874 | 0.001 |
| 944.92054 | -0.001 |
| 945.16234 | 0.014 |
| 945.40415 | -0.008 |
| 945.64596 | 0.007 |
| 945.88779 | -0.01 |
| 946.12961 | 0.001 |
| 946.37145 | -0.003 |
| 946.61328 | -0.003 |
| 946.85513 | -0.008 |
| 947.09698 | 0.001 |
| 947.33883 | 0.004 |
| 947.58069 | -0.002 |
| 947.82256 | -0.004 |
| 948.06443 | 0.002 |
| 948.3063 | -0.007 |
| 948.54819 | -0.011 |
| 948.79007 | -0.002 |
| 949.03197 | 0.01 |
| 949.27387 | -0.004 |
| 949.51577 | 0.007 |
| 949.75768 | -0.005 |
| 949.9996 | 0.003 |
| 950.24152 | 0.005 |
| 950.48344 | 0.004 |
| 950.72538 | -0.003 |
| 950.96731 | 0 |
| 951.20926 | -0.01 |
| 951.45121 | 0.005 |
| 951.69316 | -0.004 |
| 951.93512 | 0.003 |
| 952.17708 | 0.002 |
| 952.41906 | 0.012 |
| 952.66103 | -0.003 |
| 952.90301 | 0 |
| 953.145 | -0.001 |
| 953.38699 | 0.005 |
| 953.62899 | -0.007 |
| 953.87099 | -0.004 |
| 954.113 | -0.01 |
| 954.35502 | 0.007 |
| 954.59704 | -0.006 |
| 954.83906 | -0.001 |
| 955.08109 | -0.013 |
| 955.32313 | 0.007 |
| 955.56517 | -0.002 |
| 955.80722 | 0.003 |
| 956.04927 | 0 |
| 956.29133 | -0.001 |
| 956.53339 | -0.002 |
| 956.77546 | 0.003 |
| 957.01753 | -0.002 |
| 957.25961 | 0.002 |
| 957.5017 | -0.001 |
| 957.74379 | 0.002 |
| 957.98588 | -0.008 |
| 958.22798 | 0.009 |
| 958.47009 | -0.006 |
| 958.7122 | 0.004 |
| 958.95432 | -0.008 |
| 959.19644 | 0 |
| 959.43857 | -0.008 |
| 959.6807 | 0.008 |
| 959.92284 | -0.003 |
| 960.16498 | -0.007 |
| 960.40713 | 0.003 |
| 960.64929 | 0.016 |
| 960.89145 | 0.001 |
| 961.13361 | 0.003 |
| 961.37578 | -0.005 |
| 961.61796 | 0.009 |
| 961.86014 | -0.001 |
| 962.10233 | 0.003 |
| 962.34452 | -0.001 |
| 962.58671 | 0.007 |
| 962.82892 | -0.002 |
| 963.07112 | -0.001 |
| 963.31334 | -0.002 |
| 963.55556 | -0.002 |
| 963.79778 | -0.003 |
| 964.04001 | 0.001 |
| 964.28224 | -0.004 |
| 964.52448 | -0.001 |
| 964.76673 | -0.002 |
| 965.00898 | 0.002 |
| 965.25123 | -0.004 |
| 965.49349 | 0.005 |
| 965.73576 | -0.01 |
| 965.97803 | 0.003 |
| 966.22031 | -0.011 |
| 966.46259 | 0.009 |
| 966.70488 | -0.005 |
| 966.94717 | 0.001 |
| 967.18946 | 0 |
| 967.43177 | 0.008 |
| 967.67408 | -0.001 |
| 967.91639 | 0 |
| 968.15871 | -0.002 |
| 968.40103 | 0.001 |
| 968.64336 | -0.001 |
| 968.88569 | -0.006 |
| 969.12803 | -0.001 |
| 969.37038 | 0.004 |
| 969.61273 | 0.002 |
| 969.85508 | 0.003 |
| 970.09744 | 0 |
| 970.3398 | 0.009 |
| 970.58218 | -0.004 |
| 970.82455 | -0.004 |
| 971.06693 | -0.001 |
| 971.30932 | -0.004 |
| 971.55171 | -0.005 |
| 971.7941 | 0.009 |
| 972.03651 | -0.002 |
| 972.27891 | 0.001 |
| 972.52132 | 0.001 |
| 972.76374 | 0.01 |
| 973.00616 | -0.012 |
| 973.24859 | -0.007 |
| 973.49102 | -0.003 |
| 973.73346 | 0.018 |
| 973.9759 | -0.001 |
| 974.21835 | 0.007 |
| 974.4608 | -0.005 |
| 974.70326 | 0.001 |
| 974.94572 | -0.009 |
| 975.18819 | 0 |
| 975.43066 | -0.005 |
| 975.67314 | 0 |
| 975.91562 | -0.004 |
| 976.15811 | 0.003 |
| 976.40061 | 0.001 |
| 976.6431 | 0.006 |
| 976.88561 | 0.003 |
| 977.12812 | 0.008 |
| 977.37063 | 0.002 |
| 977.61315 | 0.005 |
| 977.85567 | -0.001 |
| 978.0982 | 0.009 |
| 978.34074 | -0.005 |
| 978.58327 | 0.005 |
| 978.82582 | -0.003 |
| 979.06837 | 0.007 |
| 979.31092 | 0.001 |
| 979.55348 | 0.007 |
| 979.79604 | 0.007 |
| 980.03861 | 0.012 |
| 980.28119 | 0.001 |
| 980.52377 | 0.01 |
| 980.76635 | -0.003 |
| 981.00894 | 0.007 |
| 981.25154 | 0.003 |
| 981.49413 | 0 |
| 981.73674 | 0.005 |
| 981.97935 | 0.008 |
| 982.22196 | -0.002 |
| 982.46458 | 0.004 |
| 982.70721 | -0.01 |
| 982.94983 | 0.006 |
| 983.19247 | -0.006 |
| 983.43511 | 0.004 |
| 983.67775 | 0 |
| 983.9204 | 0.004 |
| 984.16306 | -0.002 |
| 984.40571 | 0.004 |
| 984.64838 | -0.002 |
| 984.89105 | 0.01 |
| 985.13372 | -0.003 |
| 985.3764 | 0.007 |
| 985.61908 | -0.01 |
| 985.86177 | 0.006 |
| 986.10447 | 0.002 |
| 986.34716 | 0.008 |
| 986.58987 | -0.025 |
| 986.83258 | -0.002 |
| 987.07529 | -0.004 |
| 987.31801 | 0.004 |
| 987.56073 | 0.005 |
| 987.80346 | 0.001 |
| 988.04619 | 0 |
| 988.28893 | 0.008 |
| 988.53167 | -0.009 |
| 988.77442 | -0.001 |
| 989.01717 | 0 |
| 989.25993 | 0.007 |
| 989.50269 | -0.005 |
| 989.74546 | 0.01 |
| 989.98823 | -0.01 |
| 990.23101 | 0.013 |
| 990.47379 | -0.007 |
| 990.71657 | 0.005 |
| 990.95937 | -0.005 |
| 991.20216 | 0.005 |
| 991.44496 | -0.001 |
| 991.68777 | 0.013 |
| 991.93058 | -0.018 |
| 992.17339 | 0.024 |
| 992.41621 | 0.003 |
| 992.65904 | 0.006 |
| 992.90187 | -0.015 |
| 993.1447 | 0.004 |
| 993.38754 | 0.001 |
| 993.63039 | 0.01 |
| 993.87324 | 0.002 |
| 994.11609 | -0.004 |
| 994.35895 | -0.007 |
| 994.60181 | 0.006 |
| 994.84468 | -0.004 |
| 995.08755 | -0.006 |
| 995.33043 | -0.004 |
| 995.57331 | 0.001 |
| 995.8162 | -0.008 |
| 996.05909 | -0.002 |
| 996.30199 | -0.006 |
| 996.54489 | 0.004 |
| 996.7878 | 0.002 |
| 997.03071 | 0.008 |
| 997.27363 | -0.012 |
| 997.51655 | 0.01 |
| 997.75947 | 0.004 |
| 998.0024 | -0.01 |
| 998.24534 | -0.006 |
| 998.48828 | 0.009 |
| 998.73122 | 0 |
| 998.97417 | 0.003 |
| 999.21712 | 0.014 |
| 999.46008 | 0.013 |
| 999.70304 | -0.001 |
| 999.94601 | 0.003 |
| 1000.18898 | -0.001 |
| 1000.43196 | 0.005 |
| 1000.67494 | -0.002 |
| 1000.91793 | 0.008 |
| 1001.16092 | 0.014 |
| 1001.40392 | -0.002 |
| 1001.64692 | -0.008 |
| 1001.88992 | 0.005 |
| 1002.13293 | -0.01 |
| 1002.37595 | 0.015 |
| 1002.61897 | -0.02 |
| 1002.86199 | 0.012 |
| 1003.10502 | 0.01 |
| 1003.34805 | 0.012 |
| 1003.59109 | -0.012 |
| 1003.83413 | 0.024 |
| 1004.07718 | -0.012 |
| 1004.32023 | -0.016 |
| 1004.56329 | 0.007 |
| 1004.80635 | 0.011 |
| 1005.04941 | 0.001 |
| 1005.29248 | -0.019 |
| 1005.53556 | 0.01 |
| 1005.77864 | -0.012 |
| 1006.02172 | 0.015 |
| 1006.26481 | 0 |
| 1006.5079 | 0.004 |
| 1006.751 | 0.012 |
| 1006.9941 | 0.012 |
| 1007.23721 | -0.017 |
| 1007.48032 | -0.008 |
| 1007.72344 | 0.008 |
| 1007.96656 | 0.023 |
| 1008.20968 | 0 |
| 1008.45281 | -0.007 |
| 1008.69595 | -0.008 |
| 1008.93909 | -0.006 |
| 1009.18223 | 0.007 |
| 1009.42538 | 0.016 |
| 1009.66853 | -0.007 |
| 1009.91169 | -0.002 |
| 1010.15485 | -0.005 |
| 1010.39801 | -0.006 |
| 1010.64118 | 0.005 |
| 1010.88436 | 0.017 |
| 1011.12754 | 0.013 |
| 1011.37072 | 0.015 |
| 1011.61391 | -0.022 |
| 1011.8571 | 0.007 |
| 1012.1003 | -0.019 |
| 1012.3435 | 0.013 |
| 1012.58671 | -0.04 |
| 1012.82992 | 0.018 |
| 1013.07314 | -0.001 |
| 1013.31636 | 0.007 |
| 1013.55958 | -0.01 |
| 1013.80281 | -0.004 |
| 1014.04604 | -0.005 |
| 1014.28928 | 0.007 |
| 1014.53252 | -0.023 |
| 1014.77577 | 0.025 |
| 1015.01902 | -0.015 |
| 1015.26228 | -0.006 |
| 1015.50554 | -0.013 |
| 1015.7488 | 0.03 |
| 1015.99207 | -0.034 |
| 1016.23535 | 0.027 |
| 1016.47862 | -0.014 |
| 1016.72191 | 0.016 |
| 1016.96519 | -0.005 |
| 1017.20848 | 0.006 |
| 1017.45178 | -0.035 |
| 1017.69508 | 0.002 |
| 1017.93838 | -0.01 |
| 1018.18169 | 0.017 |
| 1018.425 | -0.004 |
| 1018.66832 | 0.029 |
| 1018.91164 | 0.011 |
| 1019.15497 | 0.005 |
| 1019.3983 | 0.006 |
| 1019.64164 | 0.017 |
| 1019.88498 | -0.022 |
| 1020.12832 | 0.016 |
| 1020.37167 | -0.038 |
| 1020.61502 | 0.004 |
| 1020.85838 | -0.034 |
| 1021.10174 | 0.014 |
| 1021.3451 | 0.005 |
| 1021.58847 | 0.006 |
| 1021.83185 | 0.018 |
| 1022.07523 | 0 |
| 1022.31861 | -0.027 |
| 1022.562 | -0.015 |
| 1022.80539 | 0.001 |
| 1023.04878 | -0.008 |
| 1023.29218 | -0.019 |
| 1023.53559 | 0.017 |
| 1023.779 | 0 |
| 1024.02241 | 0 |
| 1024.26583 | 0 |
| 1024.50925 | 0 |
| 1024.75268 | 0 |
| 1024.99611 | 0 |
| 1025.23954 | 0 |
| 1025.48298 | 0 |
| 1025.72642 | 0 |
| 1025.96987 | 0 |
| 1026.21332 | 0 |
| 1026.45678 | 0 |
| 1026.70024 | 0 |
| 1026.9437 | 0 |
| 1027.18717 | 0 |
| 1027.43064 | 0 |